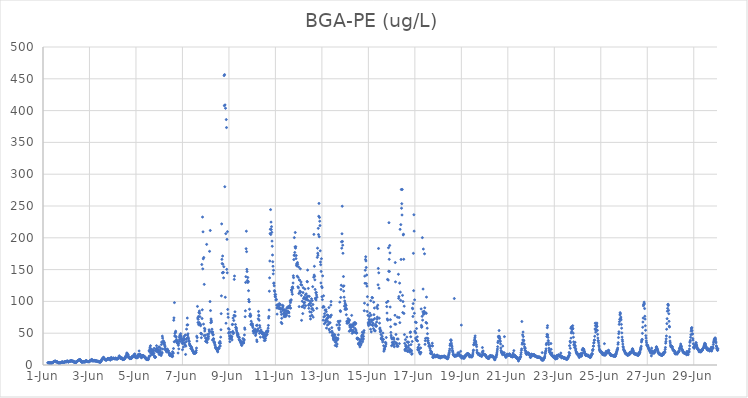
| Category | BGA-PE (ug/L) |
|---|---|
| 44348.208333333336 | 3.53 |
| 44348.21875 | 3.23 |
| 44348.229166666664 | 3.58 |
| 44348.239583333336 | 3.42 |
| 44348.25 | 3.65 |
| 44348.260416666664 | 3.82 |
| 44348.270833333336 | 3.14 |
| 44348.28125 | 3.12 |
| 44348.291666666664 | 3.01 |
| 44348.302083333336 | 2.98 |
| 44348.3125 | 3.2 |
| 44348.322916666664 | 3.79 |
| 44348.333333333336 | 2.96 |
| 44348.34375 | 3.03 |
| 44348.354166666664 | 3.2 |
| 44348.364583333336 | 3.13 |
| 44348.375 | 3.04 |
| 44348.385416666664 | 3.1 |
| 44348.395833333336 | 3.68 |
| 44348.40625 | 3.52 |
| 44348.416666666664 | 3.73 |
| 44348.427083333336 | 3.97 |
| 44348.4375 | 4.63 |
| 44348.447916666664 | 4.94 |
| 44348.458333333336 | 5.03 |
| 44348.46875 | 5.09 |
| 44348.479166666664 | 5.72 |
| 44348.489583333336 | 5.74 |
| 44348.5 | 5.69 |
| 44348.510416666664 | 5.68 |
| 44348.520833333336 | 5.97 |
| 44348.53125 | 6.37 |
| 44348.541666666664 | 5.16 |
| 44348.552083333336 | 5.57 |
| 44348.5625 | 5.05 |
| 44348.572916666664 | 4.85 |
| 44348.583333333336 | 4.99 |
| 44348.59375 | 5.27 |
| 44348.604166666664 | 5.09 |
| 44348.614583333336 | 4.27 |
| 44348.625 | 4.83 |
| 44348.635416666664 | 4.36 |
| 44348.645833333336 | 4.21 |
| 44348.65625 | 3.02 |
| 44348.666666666664 | 3.1 |
| 44348.677083333336 | 3.44 |
| 44348.6875 | 3.7 |
| 44348.697916666664 | 3.22 |
| 44348.708333333336 | 2.91 |
| 44348.71875 | 3 |
| 44348.729166666664 | 3.87 |
| 44348.739583333336 | 3.36 |
| 44348.75 | 3.62 |
| 44348.760416666664 | 3.22 |
| 44348.770833333336 | 3.89 |
| 44348.78125 | 4.23 |
| 44348.791666666664 | 4.08 |
| 44348.802083333336 | 4.46 |
| 44348.8125 | 4.6 |
| 44348.822916666664 | 3.99 |
| 44348.833333333336 | 4.69 |
| 44348.84375 | 5 |
| 44348.854166666664 | 4.03 |
| 44348.864583333336 | 4.51 |
| 44348.875 | 4.02 |
| 44348.885416666664 | 4.05 |
| 44348.895833333336 | 4.16 |
| 44348.90625 | 4.16 |
| 44348.916666666664 | 4.5 |
| 44348.927083333336 | 4.9 |
| 44348.9375 | 5.03 |
| 44348.947916666664 | 4.99 |
| 44348.958333333336 | 5.2 |
| 44348.96875 | 4.94 |
| 44348.979166666664 | 5.28 |
| 44348.989583333336 | 5.08 |
| 44349.0 | 5.03 |
| 44349.010416666664 | 5.14 |
| 44349.020833333336 | 5.26 |
| 44349.03125 | 6.22 |
| 44349.041666666664 | 6.49 |
| 44349.052083333336 | 5.85 |
| 44349.0625 | 5.36 |
| 44349.072916666664 | 5.7 |
| 44349.083333333336 | 4.73 |
| 44349.09375 | 4.7 |
| 44349.104166666664 | 5.08 |
| 44349.114583333336 | 5.92 |
| 44349.125 | 5.86 |
| 44349.135416666664 | 5.6 |
| 44349.145833333336 | 5.92 |
| 44349.15625 | 5.67 |
| 44349.166666666664 | 6.01 |
| 44349.177083333336 | 6.52 |
| 44349.1875 | 6.09 |
| 44349.197916666664 | 6.7 |
| 44349.208333333336 | 6.52 |
| 44349.21875 | 6.6 |
| 44349.229166666664 | 6.83 |
| 44349.239583333336 | 6.26 |
| 44349.25 | 6.33 |
| 44349.260416666664 | 6 |
| 44349.270833333336 | 5.93 |
| 44349.28125 | 5.61 |
| 44349.291666666664 | 5.34 |
| 44349.302083333336 | 6.12 |
| 44349.3125 | 4.7 |
| 44349.322916666664 | 4.98 |
| 44349.333333333336 | 5.22 |
| 44349.34375 | 4.91 |
| 44349.354166666664 | 4.45 |
| 44349.364583333336 | 4.09 |
| 44349.375 | 4.23 |
| 44349.385416666664 | 4.86 |
| 44349.395833333336 | 3.84 |
| 44349.40625 | 4.57 |
| 44349.416666666664 | 4.26 |
| 44349.427083333336 | 3.85 |
| 44349.4375 | 4.9 |
| 44349.447916666664 | 5.09 |
| 44349.458333333336 | 5.29 |
| 44349.46875 | 6.02 |
| 44349.479166666664 | 6.06 |
| 44349.489583333336 | 6.38 |
| 44349.5 | 6.63 |
| 44349.510416666664 | 6.68 |
| 44349.520833333336 | 7.1 |
| 44349.53125 | 7.1 |
| 44349.541666666664 | 7.68 |
| 44349.552083333336 | 8 |
| 44349.5625 | 8.58 |
| 44349.572916666664 | 8.28 |
| 44349.583333333336 | 8.42 |
| 44349.59375 | 8.44 |
| 44349.604166666664 | 8.3 |
| 44349.614583333336 | 6.85 |
| 44349.625 | 6.81 |
| 44349.635416666664 | 5.51 |
| 44349.645833333336 | 5.53 |
| 44349.65625 | 4.84 |
| 44349.666666666664 | 4.74 |
| 44349.677083333336 | 4.25 |
| 44349.6875 | 4.99 |
| 44349.697916666664 | 4.61 |
| 44349.708333333336 | 4.88 |
| 44349.71875 | 5.2 |
| 44349.729166666664 | 5.36 |
| 44349.739583333336 | 4.64 |
| 44349.75 | 4.87 |
| 44349.760416666664 | 5.46 |
| 44349.770833333336 | 5.43 |
| 44349.78125 | 5.07 |
| 44349.791666666664 | 5.59 |
| 44349.802083333336 | 4.3 |
| 44349.8125 | 5.21 |
| 44349.822916666664 | 5.59 |
| 44349.833333333336 | 5.76 |
| 44349.84375 | 6.41 |
| 44349.854166666664 | 6.95 |
| 44349.864583333336 | 6.71 |
| 44349.875 | 6.48 |
| 44349.885416666664 | 6.28 |
| 44349.895833333336 | 5.22 |
| 44349.90625 | 5.64 |
| 44349.916666666664 | 5.41 |
| 44349.927083333336 | 5.2 |
| 44349.9375 | 5.19 |
| 44349.947916666664 | 5.18 |
| 44349.958333333336 | 5.25 |
| 44349.96875 | 5.46 |
| 44349.979166666664 | 5.4 |
| 44349.989583333336 | 5.94 |
| 44350.0 | 6.13 |
| 44350.010416666664 | 5.98 |
| 44350.020833333336 | 6.73 |
| 44350.03125 | 6.53 |
| 44350.041666666664 | 6.68 |
| 44350.052083333336 | 6.89 |
| 44350.0625 | 6.54 |
| 44350.072916666664 | 7.18 |
| 44350.083333333336 | 8.68 |
| 44350.09375 | 6.75 |
| 44350.104166666664 | 8.64 |
| 44350.114583333336 | 7.33 |
| 44350.125 | 7.49 |
| 44350.135416666664 | 6.47 |
| 44350.145833333336 | 6.52 |
| 44350.15625 | 6.51 |
| 44350.166666666664 | 7.18 |
| 44350.177083333336 | 6.75 |
| 44350.1875 | 6.52 |
| 44350.197916666664 | 6.59 |
| 44350.208333333336 | 7.23 |
| 44350.21875 | 6.58 |
| 44350.229166666664 | 7.03 |
| 44350.239583333336 | 6.45 |
| 44350.25 | 6.15 |
| 44350.260416666664 | 6.91 |
| 44350.270833333336 | 6.15 |
| 44350.28125 | 6.57 |
| 44350.291666666664 | 6.07 |
| 44350.302083333336 | 6.14 |
| 44350.3125 | 6.23 |
| 44350.322916666664 | 6 |
| 44350.333333333336 | 6.11 |
| 44350.34375 | 5.78 |
| 44350.354166666664 | 5.55 |
| 44350.364583333336 | 5.4 |
| 44350.375 | 4.93 |
| 44350.385416666664 | 5.82 |
| 44350.395833333336 | 5.38 |
| 44350.40625 | 5.09 |
| 44350.416666666664 | 5.43 |
| 44350.427083333336 | 4.65 |
| 44350.4375 | 4.91 |
| 44350.447916666664 | 4.56 |
| 44350.458333333336 | 4.35 |
| 44350.46875 | 4.82 |
| 44350.479166666664 | 4.73 |
| 44350.489583333336 | 5.73 |
| 44350.5 | 5.99 |
| 44350.510416666664 | 6.62 |
| 44350.520833333336 | 7.7 |
| 44350.53125 | 8.76 |
| 44350.541666666664 | 9.12 |
| 44350.552083333336 | 9.67 |
| 44350.5625 | 10.07 |
| 44350.572916666664 | 10.57 |
| 44350.583333333336 | 11.12 |
| 44350.59375 | 11.06 |
| 44350.604166666664 | 12.14 |
| 44350.614583333336 | 11.14 |
| 44350.625 | 11.09 |
| 44350.635416666664 | 10.12 |
| 44350.645833333336 | 8.65 |
| 44350.65625 | 8.45 |
| 44350.666666666664 | 9.01 |
| 44350.677083333336 | 8.37 |
| 44350.6875 | 8.31 |
| 44350.697916666664 | 7.74 |
| 44350.708333333336 | 7.95 |
| 44350.71875 | 7.88 |
| 44350.729166666664 | 7.85 |
| 44350.739583333336 | 8.01 |
| 44350.75 | 8.26 |
| 44350.760416666664 | 8.72 |
| 44350.770833333336 | 9.41 |
| 44350.78125 | 9.94 |
| 44350.791666666664 | 10.33 |
| 44350.802083333336 | 10.52 |
| 44350.8125 | 9.42 |
| 44350.822916666664 | 9.52 |
| 44350.833333333336 | 9.24 |
| 44350.84375 | 9.43 |
| 44350.854166666664 | 9.84 |
| 44350.864583333336 | 10.28 |
| 44350.875 | 9.24 |
| 44350.885416666664 | 8.03 |
| 44350.895833333336 | 7.84 |
| 44350.90625 | 8.31 |
| 44350.916666666664 | 10.1 |
| 44350.927083333336 | 10.98 |
| 44350.9375 | 11.9 |
| 44350.947916666664 | 10.52 |
| 44350.958333333336 | 9.74 |
| 44350.96875 | 9.78 |
| 44350.979166666664 | 10.59 |
| 44350.989583333336 | 9.84 |
| 44351.0 | 9.63 |
| 44351.010416666664 | 10.08 |
| 44351.020833333336 | 10.25 |
| 44351.03125 | 10.81 |
| 44351.041666666664 | 10.83 |
| 44351.052083333336 | 10.41 |
| 44351.0625 | 10.12 |
| 44351.072916666664 | 10.06 |
| 44351.083333333336 | 9.76 |
| 44351.09375 | 10.1 |
| 44351.104166666664 | 9.9 |
| 44351.114583333336 | 9.51 |
| 44351.125 | 11.16 |
| 44351.135416666664 | 9.93 |
| 44351.145833333336 | 9.77 |
| 44351.15625 | 9.96 |
| 44351.166666666664 | 9.6 |
| 44351.177083333336 | 9.45 |
| 44351.1875 | 10.03 |
| 44351.197916666664 | 9.64 |
| 44351.208333333336 | 9.4 |
| 44351.21875 | 9.98 |
| 44351.229166666664 | 11.03 |
| 44351.239583333336 | 10.57 |
| 44351.25 | 11.9 |
| 44351.260416666664 | 11.45 |
| 44351.270833333336 | 11.64 |
| 44351.28125 | 14.46 |
| 44351.291666666664 | 11.91 |
| 44351.302083333336 | 11.73 |
| 44351.3125 | 11.4 |
| 44351.322916666664 | 12.2 |
| 44351.333333333336 | 10.23 |
| 44351.34375 | 10.81 |
| 44351.354166666664 | 11.25 |
| 44351.364583333336 | 10.19 |
| 44351.375 | 11.21 |
| 44351.385416666664 | 11.07 |
| 44351.395833333336 | 11.1 |
| 44351.40625 | 10.48 |
| 44351.416666666664 | 9.68 |
| 44351.427083333336 | 8.52 |
| 44351.4375 | 8.58 |
| 44351.447916666664 | 8.83 |
| 44351.458333333336 | 8.92 |
| 44351.46875 | 9.45 |
| 44351.479166666664 | 8.79 |
| 44351.489583333336 | 9.2 |
| 44351.5 | 9.51 |
| 44351.510416666664 | 10.08 |
| 44351.520833333336 | 10.21 |
| 44351.53125 | 12.13 |
| 44351.541666666664 | 12.22 |
| 44351.552083333336 | 13.61 |
| 44351.5625 | 13.64 |
| 44351.572916666664 | 13.13 |
| 44351.583333333336 | 12.43 |
| 44351.59375 | 15.88 |
| 44351.604166666664 | 18.5 |
| 44351.614583333336 | 18.88 |
| 44351.625 | 16.61 |
| 44351.635416666664 | 13 |
| 44351.645833333336 | 16.12 |
| 44351.65625 | 16.67 |
| 44351.666666666664 | 15 |
| 44351.677083333336 | 12.3 |
| 44351.6875 | 11.74 |
| 44351.697916666664 | 11.86 |
| 44351.708333333336 | 11.52 |
| 44351.71875 | 11.4 |
| 44351.729166666664 | 10.44 |
| 44351.739583333336 | 9.79 |
| 44351.75 | 11.57 |
| 44351.760416666664 | 10.46 |
| 44351.770833333336 | 10.32 |
| 44351.78125 | 10.03 |
| 44351.791666666664 | 10.38 |
| 44351.802083333336 | 10.24 |
| 44351.8125 | 11.02 |
| 44351.822916666664 | 12.71 |
| 44351.833333333336 | 12.86 |
| 44351.84375 | 13.06 |
| 44351.854166666664 | 14.04 |
| 44351.864583333336 | 12.83 |
| 44351.875 | 12.83 |
| 44351.885416666664 | 13.77 |
| 44351.895833333336 | 14.64 |
| 44351.90625 | 14.58 |
| 44351.916666666664 | 13.58 |
| 44351.927083333336 | 16.34 |
| 44351.9375 | 16.75 |
| 44351.947916666664 | 17.35 |
| 44351.958333333336 | 12.43 |
| 44351.96875 | 13.7 |
| 44351.979166666664 | 12.48 |
| 44351.989583333336 | 12.65 |
| 44352.0 | 11.52 |
| 44352.010416666664 | 12.32 |
| 44352.020833333336 | 11.49 |
| 44352.03125 | 11.6 |
| 44352.041666666664 | 11.51 |
| 44352.052083333336 | 13.04 |
| 44352.0625 | 14.42 |
| 44352.072916666664 | 11.45 |
| 44352.083333333336 | 14.46 |
| 44352.09375 | 16.26 |
| 44352.104166666664 | 14.12 |
| 44352.114583333336 | 16.59 |
| 44352.125 | 15.27 |
| 44352.135416666664 | 22.07 |
| 44352.145833333336 | 14.95 |
| 44352.15625 | 13.95 |
| 44352.166666666664 | 17.03 |
| 44352.177083333336 | 14.49 |
| 44352.1875 | 16.6 |
| 44352.197916666664 | 14.04 |
| 44352.208333333336 | 14.19 |
| 44352.21875 | 12.05 |
| 44352.229166666664 | 13.56 |
| 44352.239583333336 | 11.41 |
| 44352.25 | 14.67 |
| 44352.260416666664 | 12.67 |
| 44352.270833333336 | 13.41 |
| 44352.28125 | 14.89 |
| 44352.291666666664 | 14.52 |
| 44352.302083333336 | 14.53 |
| 44352.3125 | 14.86 |
| 44352.322916666664 | 14.32 |
| 44352.333333333336 | 14.44 |
| 44352.34375 | 13.39 |
| 44352.354166666664 | 13.22 |
| 44352.364583333336 | 12.22 |
| 44352.375 | 13.19 |
| 44352.385416666664 | 11.57 |
| 44352.395833333336 | 12.24 |
| 44352.40625 | 11.77 |
| 44352.416666666664 | 11.02 |
| 44352.427083333336 | 10.33 |
| 44352.4375 | 9.11 |
| 44352.447916666664 | 9.06 |
| 44352.458333333336 | 9.18 |
| 44352.46875 | 8.52 |
| 44352.479166666664 | 9.15 |
| 44352.489583333336 | 9.42 |
| 44352.5 | 8.91 |
| 44352.510416666664 | 8.53 |
| 44352.520833333336 | 8.19 |
| 44352.53125 | 8.76 |
| 44352.541666666664 | 10.24 |
| 44352.552083333336 | 12.33 |
| 44352.5625 | 22.27 |
| 44352.572916666664 | 14.05 |
| 44352.583333333336 | 21.02 |
| 44352.59375 | 24.91 |
| 44352.604166666664 | 27.84 |
| 44352.614583333336 | 14.46 |
| 44352.625 | 30.29 |
| 44352.635416666664 | 18.7 |
| 44352.645833333336 | 22.19 |
| 44352.65625 | 24.41 |
| 44352.666666666664 | 24.31 |
| 44352.677083333336 | 20.45 |
| 44352.6875 | 16.5 |
| 44352.697916666664 | 20.29 |
| 44352.708333333336 | 23.74 |
| 44352.71875 | 18.52 |
| 44352.729166666664 | 16.67 |
| 44352.739583333336 | 18.59 |
| 44352.75 | 22.34 |
| 44352.760416666664 | 22.6 |
| 44352.770833333336 | 18.29 |
| 44352.78125 | 26.2 |
| 44352.791666666664 | 14.34 |
| 44352.802083333336 | 13.15 |
| 44352.8125 | 12.08 |
| 44352.822916666664 | 12.18 |
| 44352.833333333336 | 12.1 |
| 44352.84375 | 12.44 |
| 44352.854166666664 | 22.61 |
| 44352.864583333336 | 24.68 |
| 44352.875 | 21.36 |
| 44352.885416666664 | 30.33 |
| 44352.895833333336 | 26.55 |
| 44352.90625 | 25.59 |
| 44352.916666666664 | 24.11 |
| 44352.927083333336 | 21.31 |
| 44352.9375 | 24.36 |
| 44352.947916666664 | 22.37 |
| 44352.958333333336 | 20.47 |
| 44352.96875 | 19.36 |
| 44352.979166666664 | 23.79 |
| 44352.989583333336 | 28.5 |
| 44353.0 | 16.45 |
| 44353.010416666664 | 27.93 |
| 44353.020833333336 | 20.27 |
| 44353.03125 | 21.27 |
| 44353.041666666664 | 22.49 |
| 44353.052083333336 | 16.94 |
| 44353.0625 | 19.04 |
| 44353.072916666664 | 25.84 |
| 44353.083333333336 | 14.91 |
| 44353.09375 | 32.11 |
| 44353.104166666664 | 35.99 |
| 44353.114583333336 | 17.8 |
| 44353.125 | 19.66 |
| 44353.135416666664 | 45.39 |
| 44353.145833333336 | 42.31 |
| 44353.15625 | 25.1 |
| 44353.166666666664 | 35.18 |
| 44353.177083333336 | 38.22 |
| 44353.1875 | 35.63 |
| 44353.197916666664 | 33.41 |
| 44353.208333333336 | 34.97 |
| 44353.21875 | 35.68 |
| 44353.229166666664 | 32.75 |
| 44353.239583333336 | 30.49 |
| 44353.25 | 28.86 |
| 44353.260416666664 | 26.33 |
| 44353.270833333336 | 23.9 |
| 44353.28125 | 24.6 |
| 44353.291666666664 | 22.89 |
| 44353.302083333336 | 22.86 |
| 44353.3125 | 20.66 |
| 44353.322916666664 | 21.84 |
| 44353.333333333336 | 22.81 |
| 44353.34375 | 22.75 |
| 44353.354166666664 | 25 |
| 44353.364583333336 | 23.45 |
| 44353.375 | 22.8 |
| 44353.385416666664 | 22.33 |
| 44353.395833333336 | 22.24 |
| 44353.40625 | 19.55 |
| 44353.416666666664 | 19.35 |
| 44353.427083333336 | 18.19 |
| 44353.4375 | 15.84 |
| 44353.447916666664 | 17.3 |
| 44353.458333333336 | 16.44 |
| 44353.46875 | 14.48 |
| 44353.479166666664 | 16.44 |
| 44353.489583333336 | 17.68 |
| 44353.5 | 15.49 |
| 44353.510416666664 | 15.39 |
| 44353.520833333336 | 16.07 |
| 44353.53125 | 15.64 |
| 44353.541666666664 | 14.23 |
| 44353.552083333336 | 15.72 |
| 44353.5625 | 12.98 |
| 44353.572916666664 | 20.81 |
| 44353.583333333336 | 13.93 |
| 44353.59375 | 19.13 |
| 44353.604166666664 | 18.42 |
| 44353.614583333336 | 25.86 |
| 44353.625 | 70.36 |
| 44353.635416666664 | 74.13 |
| 44353.645833333336 | 36.48 |
| 44353.65625 | 98.08 |
| 44353.666666666664 | 45.53 |
| 44353.677083333336 | 49.53 |
| 44353.6875 | 37.3 |
| 44353.697916666664 | 51.45 |
| 44353.708333333336 | 53.15 |
| 44353.71875 | 44.7 |
| 44353.729166666664 | 44.12 |
| 44353.739583333336 | 40.14 |
| 44353.75 | 38.32 |
| 44353.760416666664 | 37.32 |
| 44353.770833333336 | 35.95 |
| 44353.78125 | 34.27 |
| 44353.791666666664 | 33.94 |
| 44353.802083333336 | 34.26 |
| 44353.8125 | 18.86 |
| 44353.822916666664 | 30.8 |
| 44353.833333333336 | 33.37 |
| 44353.84375 | 25.37 |
| 44353.854166666664 | 37.55 |
| 44353.864583333336 | 43.61 |
| 44353.875 | 40.29 |
| 44353.885416666664 | 46.75 |
| 44353.895833333336 | 36.92 |
| 44353.90625 | 44.55 |
| 44353.916666666664 | 45.83 |
| 44353.927083333336 | 49.21 |
| 44353.9375 | 45.22 |
| 44353.947916666664 | 41.2 |
| 44353.958333333336 | 41.25 |
| 44353.96875 | 41.41 |
| 44353.979166666664 | 38.06 |
| 44353.989583333336 | 34.21 |
| 44354.0 | 24.06 |
| 44354.010416666664 | 33.68 |
| 44354.020833333336 | 35.54 |
| 44354.03125 | 38.84 |
| 44354.041666666664 | 28.17 |
| 44354.052083333336 | 42.51 |
| 44354.0625 | 40.7 |
| 44354.072916666664 | 45.15 |
| 44354.083333333336 | 39.75 |
| 44354.09375 | 34.94 |
| 44354.104166666664 | 32 |
| 44354.114583333336 | 31.1 |
| 44354.125 | 47.24 |
| 44354.135416666664 | 16.59 |
| 44354.145833333336 | 29.65 |
| 44354.15625 | 40.48 |
| 44354.166666666664 | 36.64 |
| 44354.177083333336 | 56.39 |
| 44354.1875 | 41.9 |
| 44354.197916666664 | 62.86 |
| 44354.208333333336 | 73.81 |
| 44354.21875 | 46.75 |
| 44354.229166666664 | 63.2 |
| 44354.239583333336 | 49.04 |
| 44354.25 | 43.65 |
| 44354.260416666664 | 41.32 |
| 44354.270833333336 | 38.62 |
| 44354.28125 | 37.64 |
| 44354.291666666664 | 36.84 |
| 44354.302083333336 | 33.61 |
| 44354.3125 | 32.26 |
| 44354.322916666664 | 30.78 |
| 44354.333333333336 | 30.43 |
| 44354.34375 | 29.45 |
| 44354.354166666664 | 29.39 |
| 44354.364583333336 | 25.86 |
| 44354.375 | 26.13 |
| 44354.385416666664 | 26.82 |
| 44354.395833333336 | 28.01 |
| 44354.40625 | 26.36 |
| 44354.416666666664 | 24.1 |
| 44354.427083333336 | 23.16 |
| 44354.4375 | 22.87 |
| 44354.447916666664 | 21.3 |
| 44354.458333333336 | 21 |
| 44354.46875 | 21.28 |
| 44354.479166666664 | 19.23 |
| 44354.489583333336 | 18.18 |
| 44354.5 | 19.58 |
| 44354.510416666664 | 19.21 |
| 44354.520833333336 | 18.24 |
| 44354.53125 | 18.39 |
| 44354.541666666664 | 18.31 |
| 44354.552083333336 | 20.36 |
| 44354.5625 | 19.76 |
| 44354.572916666664 | 19.19 |
| 44354.583333333336 | 19.87 |
| 44354.59375 | 22.81 |
| 44354.604166666664 | 26.64 |
| 44354.614583333336 | 45.29 |
| 44354.625 | 37.67 |
| 44354.635416666664 | 43.06 |
| 44354.645833333336 | 92.13 |
| 44354.65625 | 73.88 |
| 44354.666666666664 | 66.7 |
| 44354.677083333336 | 71.72 |
| 44354.6875 | 76.31 |
| 44354.697916666664 | 63.39 |
| 44354.708333333336 | 82.44 |
| 44354.71875 | 66.76 |
| 44354.729166666664 | 84.86 |
| 44354.739583333336 | 81.14 |
| 44354.75 | 76.03 |
| 44354.760416666664 | 64.14 |
| 44354.770833333336 | 63.78 |
| 44354.78125 | 61.78 |
| 44354.791666666664 | 49.85 |
| 44354.802083333336 | 49.6 |
| 44354.8125 | 42.93 |
| 44354.822916666664 | 48.6 |
| 44354.833333333336 | 157.98 |
| 44354.84375 | 73.09 |
| 44354.854166666664 | 86.81 |
| 44354.864583333336 | 232.61 |
| 44354.875 | 151.14 |
| 44354.885416666664 | 209.37 |
| 44354.895833333336 | 166.95 |
| 44354.90625 | 64.29 |
| 44354.916666666664 | 169 |
| 44354.927083333336 | 46.19 |
| 44354.9375 | 126.79 |
| 44354.947916666664 | 57.67 |
| 44354.958333333336 | 53.52 |
| 44354.96875 | 56.52 |
| 44354.979166666664 | 46.71 |
| 44354.989583333336 | 42.35 |
| 44355.0 | 37.35 |
| 44355.010416666664 | 37.46 |
| 44355.020833333336 | 37.02 |
| 44355.03125 | 40.93 |
| 44355.041666666664 | 189.64 |
| 44355.052083333336 | 38.55 |
| 44355.0625 | 35.42 |
| 44355.072916666664 | 47.95 |
| 44355.083333333336 | 43.59 |
| 44355.09375 | 42.53 |
| 44355.104166666664 | 42.79 |
| 44355.114583333336 | 41.06 |
| 44355.125 | 45.15 |
| 44355.135416666664 | 49.2 |
| 44355.145833333336 | 55.36 |
| 44355.15625 | 53.31 |
| 44355.166666666664 | 178.7 |
| 44355.177083333336 | 52.46 |
| 44355.1875 | 99.74 |
| 44355.197916666664 | 211.5 |
| 44355.208333333336 | 85.54 |
| 44355.21875 | 66.51 |
| 44355.229166666664 | 72.41 |
| 44355.239583333336 | 70.07 |
| 44355.25 | 67.53 |
| 44355.260416666664 | 52.19 |
| 44355.270833333336 | 56.31 |
| 44355.28125 | 50.02 |
| 44355.291666666664 | 39.27 |
| 44355.302083333336 | 51.98 |
| 44355.3125 | 47.32 |
| 44355.322916666664 | 47.63 |
| 44355.333333333336 | 41.39 |
| 44355.34375 | 41.08 |
| 44355.354166666664 | 35.92 |
| 44355.364583333336 | 36.9 |
| 44355.375 | 35.05 |
| 44355.385416666664 | 34.8 |
| 44355.395833333336 | 32.01 |
| 44355.40625 | 31 |
| 44355.416666666664 | 28.09 |
| 44355.427083333336 | 26.92 |
| 44355.4375 | 27.48 |
| 44355.447916666664 | 26.1 |
| 44355.458333333336 | 25.84 |
| 44355.46875 | 25 |
| 44355.479166666664 | 25.34 |
| 44355.489583333336 | 23.83 |
| 44355.5 | 22.25 |
| 44355.510416666664 | 22.89 |
| 44355.520833333336 | 20.58 |
| 44355.53125 | 25.72 |
| 44355.541666666664 | 26.17 |
| 44355.552083333336 | 27 |
| 44355.5625 | 26.02 |
| 44355.572916666664 | 25.77 |
| 44355.583333333336 | 34.92 |
| 44355.59375 | 34.05 |
| 44355.604166666664 | 29.31 |
| 44355.614583333336 | 36.97 |
| 44355.625 | 29.95 |
| 44355.635416666664 | 34.27 |
| 44355.645833333336 | 43.82 |
| 44355.65625 | 55.43 |
| 44355.666666666664 | 80.72 |
| 44355.677083333336 | 108.7 |
| 44355.6875 | 221.83 |
| 44355.697916666664 | 166.08 |
| 44355.708333333336 | 159.53 |
| 44355.71875 | 144.94 |
| 44355.729166666664 | 171.34 |
| 44355.739583333336 | 158.51 |
| 44355.75 | 145.55 |
| 44355.760416666664 | 145.49 |
| 44355.770833333336 | 137.03 |
| 44355.78125 | 154.52 |
| 44355.791666666664 | 455.06 |
| 44355.802083333336 | 407.74 |
| 44355.8125 | 456.56 |
| 44355.822916666664 | 280.3 |
| 44355.833333333336 | 408.97 |
| 44355.84375 | 106.52 |
| 44355.854166666664 | 403.65 |
| 44355.864583333336 | 206.48 |
| 44355.875 | 65.67 |
| 44355.885416666664 | 385.87 |
| 44355.895833333336 | 373.3 |
| 44355.90625 | 150.37 |
| 44355.916666666664 | 197.51 |
| 44355.927083333336 | 144.96 |
| 44355.9375 | 209.69 |
| 44355.947916666664 | 87.32 |
| 44355.958333333336 | 80.35 |
| 44355.96875 | 74.93 |
| 44355.979166666664 | 57.36 |
| 44355.989583333336 | 49.84 |
| 44356.0 | 51.26 |
| 44356.010416666664 | 56.16 |
| 44356.020833333336 | 45.55 |
| 44356.03125 | 41.15 |
| 44356.041666666664 | 36.71 |
| 44356.052083333336 | 43.04 |
| 44356.0625 | 41.89 |
| 44356.072916666664 | 46.21 |
| 44356.083333333336 | 51.37 |
| 44356.09375 | 44.85 |
| 44356.104166666664 | 44.96 |
| 44356.114583333336 | 42.46 |
| 44356.125 | 44.52 |
| 44356.135416666664 | 39.48 |
| 44356.145833333336 | 63.57 |
| 44356.15625 | 63.83 |
| 44356.166666666664 | 52.81 |
| 44356.177083333336 | 73.81 |
| 44356.1875 | 49.26 |
| 44356.197916666664 | 50.61 |
| 44356.208333333336 | 70.04 |
| 44356.21875 | 78.07 |
| 44356.229166666664 | 134.6 |
| 44356.239583333336 | 139.86 |
| 44356.25 | 76.97 |
| 44356.260416666664 | 83.65 |
| 44356.270833333336 | 77.13 |
| 44356.28125 | 63.65 |
| 44356.291666666664 | 58.85 |
| 44356.302083333336 | 59.31 |
| 44356.3125 | 55.71 |
| 44356.322916666664 | 57.86 |
| 44356.333333333336 | 53.48 |
| 44356.34375 | 51.43 |
| 44356.354166666664 | 49.05 |
| 44356.364583333336 | 46.77 |
| 44356.375 | 49.72 |
| 44356.385416666664 | 44.4 |
| 44356.395833333336 | 48.07 |
| 44356.40625 | 44.87 |
| 44356.416666666664 | 43.71 |
| 44356.427083333336 | 44.12 |
| 44356.4375 | 40.14 |
| 44356.447916666664 | 43.17 |
| 44356.458333333336 | 39.3 |
| 44356.46875 | 38.46 |
| 44356.479166666664 | 37.82 |
| 44356.489583333336 | 38.77 |
| 44356.5 | 36.49 |
| 44356.510416666664 | 34.94 |
| 44356.520833333336 | 34.83 |
| 44356.53125 | 34.4 |
| 44356.541666666664 | 31.87 |
| 44356.552083333336 | 30.69 |
| 44356.5625 | 34.85 |
| 44356.572916666664 | 34.87 |
| 44356.583333333336 | 35.77 |
| 44356.59375 | 35.86 |
| 44356.604166666664 | 41.53 |
| 44356.614583333336 | 35.5 |
| 44356.625 | 34.51 |
| 44356.635416666664 | 34.69 |
| 44356.645833333336 | 38.2 |
| 44356.65625 | 39.95 |
| 44356.666666666664 | 47.24 |
| 44356.677083333336 | 58.21 |
| 44356.6875 | 56.09 |
| 44356.697916666664 | 75.92 |
| 44356.708333333336 | 85.19 |
| 44356.71875 | 129.77 |
| 44356.729166666664 | 138.89 |
| 44356.739583333336 | 182.87 |
| 44356.75 | 210.38 |
| 44356.760416666664 | 178.23 |
| 44356.770833333336 | 150.36 |
| 44356.78125 | 146.98 |
| 44356.791666666664 | 132.79 |
| 44356.802083333336 | 129.99 |
| 44356.8125 | 137.58 |
| 44356.822916666664 | 130.18 |
| 44356.833333333336 | 131.43 |
| 44356.84375 | 116.83 |
| 44356.854166666664 | 102.98 |
| 44356.864583333336 | 99.79 |
| 44356.875 | 99.5 |
| 44356.885416666664 | 87.68 |
| 44356.895833333336 | 77.05 |
| 44356.90625 | 77.47 |
| 44356.916666666664 | 80.3 |
| 44356.927083333336 | 76.18 |
| 44356.9375 | 78.09 |
| 44356.947916666664 | 63.81 |
| 44356.958333333336 | 68.78 |
| 44356.96875 | 64.31 |
| 44356.979166666664 | 65.19 |
| 44356.989583333336 | 62.4 |
| 44357.0 | 64.3 |
| 44357.010416666664 | 64.36 |
| 44357.020833333336 | 61.33 |
| 44357.03125 | 58.76 |
| 44357.041666666664 | 53.29 |
| 44357.052083333336 | 53.62 |
| 44357.0625 | 50.12 |
| 44357.072916666664 | 53.75 |
| 44357.083333333336 | 52.61 |
| 44357.09375 | 53.64 |
| 44357.104166666664 | 54.95 |
| 44357.114583333336 | 54.99 |
| 44357.125 | 54.6 |
| 44357.135416666664 | 56.09 |
| 44357.145833333336 | 46.37 |
| 44357.15625 | 48.66 |
| 44357.166666666664 | 51.53 |
| 44357.177083333336 | 52.24 |
| 44357.1875 | 62.24 |
| 44357.197916666664 | 39.31 |
| 44357.208333333336 | 36.78 |
| 44357.21875 | 62.64 |
| 44357.229166666664 | 55.14 |
| 44357.239583333336 | 53.71 |
| 44357.25 | 56.88 |
| 44357.260416666664 | 72.64 |
| 44357.270833333336 | 84.22 |
| 44357.28125 | 78.34 |
| 44357.291666666664 | 77.1 |
| 44357.302083333336 | 70.37 |
| 44357.3125 | 49.79 |
| 44357.322916666664 | 62.05 |
| 44357.333333333336 | 59.1 |
| 44357.34375 | 53.14 |
| 44357.354166666664 | 43.79 |
| 44357.364583333336 | 53.48 |
| 44357.375 | 53.06 |
| 44357.385416666664 | 54.83 |
| 44357.395833333336 | 51.5 |
| 44357.40625 | 50.07 |
| 44357.416666666664 | 50.95 |
| 44357.427083333336 | 50.21 |
| 44357.4375 | 50.8 |
| 44357.447916666664 | 48.33 |
| 44357.458333333336 | 50.94 |
| 44357.46875 | 48.63 |
| 44357.479166666664 | 44.34 |
| 44357.489583333336 | 44.06 |
| 44357.5 | 42.79 |
| 44357.510416666664 | 45.45 |
| 44357.520833333336 | 38.36 |
| 44357.53125 | 49.64 |
| 44357.541666666664 | 47.45 |
| 44357.552083333336 | 41.39 |
| 44357.5625 | 38.82 |
| 44357.572916666664 | 41.88 |
| 44357.583333333336 | 45.2 |
| 44357.59375 | 46.89 |
| 44357.604166666664 | 51.61 |
| 44357.614583333336 | 52.78 |
| 44357.625 | 53.12 |
| 44357.635416666664 | 51.18 |
| 44357.645833333336 | 47.95 |
| 44357.65625 | 53.27 |
| 44357.666666666664 | 52.37 |
| 44357.677083333336 | 53.78 |
| 44357.6875 | 57.87 |
| 44357.697916666664 | 62.2 |
| 44357.708333333336 | 73.85 |
| 44357.71875 | 76.23 |
| 44357.729166666664 | 86.45 |
| 44357.739583333336 | 116.01 |
| 44357.75 | 137.01 |
| 44357.760416666664 | 163.48 |
| 44357.770833333336 | 206.64 |
| 44357.78125 | 213.39 |
| 44357.791666666664 | 244.31 |
| 44357.802083333336 | 205.18 |
| 44357.8125 | 224.68 |
| 44357.822916666664 | 212.94 |
| 44357.833333333336 | 217.54 |
| 44357.84375 | 208.54 |
| 44357.854166666664 | 194.78 |
| 44357.864583333336 | 186.67 |
| 44357.875 | 172.96 |
| 44357.885416666664 | 162.38 |
| 44357.895833333336 | 155.25 |
| 44357.90625 | 143.29 |
| 44357.916666666664 | 148.94 |
| 44357.927083333336 | 128.25 |
| 44357.9375 | 129.07 |
| 44357.947916666664 | 124.44 |
| 44357.958333333336 | 117.01 |
| 44357.96875 | 115.48 |
| 44357.979166666664 | 110.67 |
| 44357.989583333336 | 107.87 |
| 44358.0 | 106.96 |
| 44358.010416666664 | 110.84 |
| 44358.020833333336 | 102.07 |
| 44358.03125 | 102.43 |
| 44358.041666666664 | 103.08 |
| 44358.052083333336 | 94.03 |
| 44358.0625 | 89.67 |
| 44358.072916666664 | 79.98 |
| 44358.083333333336 | 89.86 |
| 44358.09375 | 94.53 |
| 44358.104166666664 | 93.99 |
| 44358.114583333336 | 93.41 |
| 44358.125 | 94.54 |
| 44358.135416666664 | 92.94 |
| 44358.145833333336 | 95.1 |
| 44358.15625 | 88.66 |
| 44358.166666666664 | 96.53 |
| 44358.177083333336 | 90.2 |
| 44358.1875 | 94.85 |
| 44358.197916666664 | 88.33 |
| 44358.208333333336 | 95.34 |
| 44358.21875 | 89.27 |
| 44358.229166666664 | 87.39 |
| 44358.239583333336 | 83.29 |
| 44358.25 | 67 |
| 44358.260416666664 | 79.5 |
| 44358.270833333336 | 73.43 |
| 44358.28125 | 65.12 |
| 44358.291666666664 | 88.03 |
| 44358.302083333336 | 93.91 |
| 44358.3125 | 90.92 |
| 44358.322916666664 | 85.58 |
| 44358.333333333336 | 92.85 |
| 44358.34375 | 86.9 |
| 44358.354166666664 | 81 |
| 44358.364583333336 | 81.15 |
| 44358.375 | 75.98 |
| 44358.385416666664 | 77.42 |
| 44358.395833333336 | 82.74 |
| 44358.40625 | 86.95 |
| 44358.416666666664 | 85.09 |
| 44358.427083333336 | 78.56 |
| 44358.4375 | 76.14 |
| 44358.447916666664 | 80.28 |
| 44358.458333333336 | 80.24 |
| 44358.46875 | 85.28 |
| 44358.479166666664 | 78.13 |
| 44358.489583333336 | 89.45 |
| 44358.5 | 84.8 |
| 44358.510416666664 | 81.93 |
| 44358.520833333336 | 84.75 |
| 44358.53125 | 91.3 |
| 44358.541666666664 | 83.93 |
| 44358.552083333336 | 90.24 |
| 44358.5625 | 90.06 |
| 44358.572916666664 | 83.35 |
| 44358.583333333336 | 81.96 |
| 44358.59375 | 76.6 |
| 44358.604166666664 | 92.82 |
| 44358.614583333336 | 93.3 |
| 44358.625 | 89.77 |
| 44358.635416666664 | 100.9 |
| 44358.645833333336 | 97.86 |
| 44358.65625 | 89.4 |
| 44358.666666666664 | 101.31 |
| 44358.677083333336 | 102.63 |
| 44358.6875 | 118.01 |
| 44358.697916666664 | 117.84 |
| 44358.708333333336 | 114.74 |
| 44358.71875 | 121.75 |
| 44358.729166666664 | 111.14 |
| 44358.739583333336 | 122.8 |
| 44358.75 | 120.57 |
| 44358.760416666664 | 128.93 |
| 44358.770833333336 | 140.29 |
| 44358.78125 | 137.35 |
| 44358.791666666664 | 165.71 |
| 44358.802083333336 | 172.66 |
| 44358.8125 | 200.29 |
| 44358.822916666664 | 172.07 |
| 44358.833333333336 | 176.95 |
| 44358.84375 | 185.75 |
| 44358.854166666664 | 208.33 |
| 44358.864583333336 | 183.72 |
| 44358.875 | 186.07 |
| 44358.885416666664 | 167.29 |
| 44358.895833333336 | 172.14 |
| 44358.90625 | 156.99 |
| 44358.916666666664 | 159.21 |
| 44358.927083333336 | 155.58 |
| 44358.9375 | 139.7 |
| 44358.947916666664 | 161.14 |
| 44358.958333333336 | 158.3 |
| 44358.96875 | 122.98 |
| 44358.979166666664 | 137.81 |
| 44358.989583333336 | 121.39 |
| 44359.0 | 154.12 |
| 44359.010416666664 | 112.42 |
| 44359.020833333336 | 91.84 |
| 44359.03125 | 133.63 |
| 44359.041666666664 | 133.51 |
| 44359.052083333336 | 116.22 |
| 44359.0625 | 113.85 |
| 44359.072916666664 | 151.23 |
| 44359.083333333336 | 115.14 |
| 44359.09375 | 126.56 |
| 44359.104166666664 | 130.58 |
| 44359.114583333336 | 109.41 |
| 44359.125 | 70.21 |
| 44359.135416666664 | 125.62 |
| 44359.145833333336 | 91.45 |
| 44359.15625 | 100.19 |
| 44359.166666666664 | 91.92 |
| 44359.177083333336 | 80.81 |
| 44359.1875 | 113.91 |
| 44359.197916666664 | 121.47 |
| 44359.208333333336 | 104.49 |
| 44359.21875 | 94.05 |
| 44359.229166666664 | 97.94 |
| 44359.239583333336 | 106.65 |
| 44359.25 | 89.79 |
| 44359.260416666664 | 98.38 |
| 44359.270833333336 | 119.41 |
| 44359.28125 | 103.28 |
| 44359.291666666664 | 110.26 |
| 44359.302083333336 | 93.28 |
| 44359.3125 | 105.19 |
| 44359.322916666664 | 111.86 |
| 44359.333333333336 | 102.95 |
| 44359.34375 | 106.53 |
| 44359.354166666664 | 105.74 |
| 44359.364583333336 | 131.27 |
| 44359.375 | 130.85 |
| 44359.385416666664 | 149.26 |
| 44359.395833333336 | 108.47 |
| 44359.40625 | 101.78 |
| 44359.416666666664 | 120.42 |
| 44359.427083333336 | 93.86 |
| 44359.4375 | 89.13 |
| 44359.447916666664 | 95.45 |
| 44359.458333333336 | 107.9 |
| 44359.46875 | 96.33 |
| 44359.479166666664 | 83.63 |
| 44359.489583333336 | 100.37 |
| 44359.5 | 76.77 |
| 44359.510416666664 | 72.38 |
| 44359.520833333336 | 97.24 |
| 44359.53125 | 92.79 |
| 44359.541666666664 | 82.96 |
| 44359.552083333336 | 104.12 |
| 44359.5625 | 88.1 |
| 44359.572916666664 | 78.09 |
| 44359.583333333336 | 101.11 |
| 44359.59375 | 89.04 |
| 44359.604166666664 | 123.15 |
| 44359.614583333336 | 95.09 |
| 44359.625 | 75.23 |
| 44359.635416666664 | 85.89 |
| 44359.645833333336 | 138.07 |
| 44359.65625 | 205.35 |
| 44359.666666666664 | 141.43 |
| 44359.677083333336 | 155.19 |
| 44359.6875 | 139.41 |
| 44359.697916666664 | 133.92 |
| 44359.708333333336 | 118.82 |
| 44359.71875 | 104.19 |
| 44359.729166666664 | 105.32 |
| 44359.739583333336 | 113.47 |
| 44359.75 | 102.22 |
| 44359.760416666664 | 114.08 |
| 44359.770833333336 | 110.15 |
| 44359.78125 | 89.04 |
| 44359.791666666664 | 106.63 |
| 44359.802083333336 | 169.2 |
| 44359.8125 | 183.68 |
| 44359.822916666664 | 175.76 |
| 44359.833333333336 | 172.52 |
| 44359.84375 | 214.86 |
| 44359.854166666664 | 205.06 |
| 44359.864583333336 | 233.83 |
| 44359.875 | 254.06 |
| 44359.885416666664 | 201.66 |
| 44359.895833333336 | 231.97 |
| 44359.90625 | 226.08 |
| 44359.916666666664 | 219.21 |
| 44359.927083333336 | 179.54 |
| 44359.9375 | 161.96 |
| 44359.947916666664 | 157.66 |
| 44359.958333333336 | 129.01 |
| 44359.96875 | 147.11 |
| 44359.979166666664 | 167.1 |
| 44359.989583333336 | 123.44 |
| 44360.0 | 107.36 |
| 44360.010416666664 | 121.61 |
| 44360.020833333336 | 102.74 |
| 44360.03125 | 140.09 |
| 44360.041666666664 | 90.57 |
| 44360.052083333336 | 70.44 |
| 44360.0625 | 92.12 |
| 44360.072916666664 | 108.83 |
| 44360.083333333336 | 75.58 |
| 44360.09375 | 91.24 |
| 44360.104166666664 | 64.79 |
| 44360.114583333336 | 80.67 |
| 44360.125 | 76.84 |
| 44360.135416666664 | 86.27 |
| 44360.145833333336 | 69.84 |
| 44360.15625 | 66.67 |
| 44360.166666666664 | 69.89 |
| 44360.177083333336 | 86.81 |
| 44360.1875 | 83.8 |
| 44360.197916666664 | 58.03 |
| 44360.208333333336 | 72.08 |
| 44360.21875 | 73.27 |
| 44360.229166666664 | 78.65 |
| 44360.239583333336 | 62.78 |
| 44360.25 | 68.67 |
| 44360.260416666664 | 78.12 |
| 44360.270833333336 | 74.23 |
| 44360.28125 | 76.32 |
| 44360.291666666664 | 64.33 |
| 44360.302083333336 | 90.3 |
| 44360.3125 | 55.44 |
| 44360.322916666664 | 56.35 |
| 44360.333333333336 | 66.53 |
| 44360.34375 | 51.77 |
| 44360.354166666664 | 66.33 |
| 44360.364583333336 | 75.38 |
| 44360.375 | 77.53 |
| 44360.385416666664 | 94.21 |
| 44360.395833333336 | 99.78 |
| 44360.40625 | 78.4 |
| 44360.416666666664 | 51.78 |
| 44360.427083333336 | 58.74 |
| 44360.4375 | 53.13 |
| 44360.447916666664 | 46.59 |
| 44360.458333333336 | 50.52 |
| 44360.46875 | 47.09 |
| 44360.479166666664 | 45.18 |
| 44360.489583333336 | 42.25 |
| 44360.5 | 40.13 |
| 44360.510416666664 | 42.67 |
| 44360.520833333336 | 38.9 |
| 44360.53125 | 48.11 |
| 44360.541666666664 | 39.39 |
| 44360.552083333336 | 43.87 |
| 44360.5625 | 47.27 |
| 44360.572916666664 | 30.74 |
| 44360.583333333336 | 35.71 |
| 44360.59375 | 41.54 |
| 44360.604166666664 | 36.16 |
| 44360.614583333336 | 37.68 |
| 44360.625 | 42.75 |
| 44360.635416666664 | 29.39 |
| 44360.645833333336 | 62.99 |
| 44360.65625 | 32.96 |
| 44360.666666666664 | 40.12 |
| 44360.677083333336 | 39.92 |
| 44360.6875 | 41.9 |
| 44360.697916666664 | 68.7 |
| 44360.708333333336 | 47.39 |
| 44360.71875 | 58.12 |
| 44360.729166666664 | 66.4 |
| 44360.739583333336 | 55.46 |
| 44360.75 | 58.13 |
| 44360.760416666664 | 62.95 |
| 44360.770833333336 | 98.86 |
| 44360.78125 | 69.15 |
| 44360.791666666664 | 85.43 |
| 44360.802083333336 | 84.02 |
| 44360.8125 | 106.22 |
| 44360.822916666664 | 118.81 |
| 44360.833333333336 | 125.37 |
| 44360.84375 | 193.72 |
| 44360.854166666664 | 183.69 |
| 44360.864583333336 | 206.31 |
| 44360.875 | 249.67 |
| 44360.885416666664 | 194.23 |
| 44360.895833333336 | 188.36 |
| 44360.90625 | 175.66 |
| 44360.916666666664 | 123.47 |
| 44360.927083333336 | 139.09 |
| 44360.9375 | 116.17 |
| 44360.947916666664 | 124.46 |
| 44360.958333333336 | 106.59 |
| 44360.96875 | 92.47 |
| 44360.979166666664 | 100.61 |
| 44360.989583333336 | 87.74 |
| 44361.0 | 97.18 |
| 44361.010416666664 | 95.16 |
| 44361.020833333336 | 87.39 |
| 44361.03125 | 89.64 |
| 44361.041666666664 | 93.59 |
| 44361.052083333336 | 79.05 |
| 44361.0625 | 87.88 |
| 44361.072916666664 | 68.8 |
| 44361.083333333336 | 65.48 |
| 44361.09375 | 66.51 |
| 44361.104166666664 | 68.04 |
| 44361.114583333336 | 68.54 |
| 44361.125 | 72.85 |
| 44361.135416666664 | 66.22 |
| 44361.145833333336 | 66.87 |
| 44361.15625 | 68.69 |
| 44361.166666666664 | 71.04 |
| 44361.177083333336 | 53.09 |
| 44361.1875 | 70.54 |
| 44361.197916666664 | 61.61 |
| 44361.208333333336 | 59.51 |
| 44361.21875 | 63 |
| 44361.229166666664 | 62.64 |
| 44361.239583333336 | 55.8 |
| 44361.25 | 54.02 |
| 44361.260416666664 | 55.33 |
| 44361.270833333336 | 59.72 |
| 44361.28125 | 78.02 |
| 44361.291666666664 | 63.35 |
| 44361.302083333336 | 49.8 |
| 44361.3125 | 62.19 |
| 44361.322916666664 | 61.95 |
| 44361.333333333336 | 52.78 |
| 44361.34375 | 54.86 |
| 44361.354166666664 | 59.79 |
| 44361.364583333336 | 65.71 |
| 44361.375 | 51.36 |
| 44361.385416666664 | 51.75 |
| 44361.395833333336 | 63.96 |
| 44361.40625 | 65.09 |
| 44361.416666666664 | 66.91 |
| 44361.427083333336 | 57.42 |
| 44361.4375 | 63.91 |
| 44361.447916666664 | 51.37 |
| 44361.458333333336 | 65.64 |
| 44361.46875 | 54.8 |
| 44361.479166666664 | 50.03 |
| 44361.489583333336 | 51.11 |
| 44361.5 | 50.35 |
| 44361.510416666664 | 41.39 |
| 44361.520833333336 | 42.57 |
| 44361.53125 | 41.24 |
| 44361.541666666664 | 40.35 |
| 44361.552083333336 | 41.72 |
| 44361.5625 | 41.18 |
| 44361.572916666664 | 33.39 |
| 44361.583333333336 | 33.03 |
| 44361.59375 | 35.05 |
| 44361.604166666664 | 31.99 |
| 44361.614583333336 | 40.21 |
| 44361.625 | 34.55 |
| 44361.635416666664 | 28.49 |
| 44361.645833333336 | 34.36 |
| 44361.65625 | 37.49 |
| 44361.666666666664 | 37.09 |
| 44361.677083333336 | 31.53 |
| 44361.6875 | 33.43 |
| 44361.697916666664 | 40.39 |
| 44361.708333333336 | 45.46 |
| 44361.71875 | 42.69 |
| 44361.729166666664 | 47.05 |
| 44361.739583333336 | 51.5 |
| 44361.75 | 36.49 |
| 44361.760416666664 | 47.96 |
| 44361.770833333336 | 39.89 |
| 44361.78125 | 41.41 |
| 44361.791666666664 | 44.96 |
| 44361.802083333336 | 51.02 |
| 44361.8125 | 54.09 |
| 44361.822916666664 | 85.35 |
| 44361.833333333336 | 97.2 |
| 44361.84375 | 139.74 |
| 44361.854166666664 | 128.51 |
| 44361.864583333336 | 149.04 |
| 44361.875 | 165.89 |
| 44361.885416666664 | 170.2 |
| 44361.895833333336 | 163.62 |
| 44361.90625 | 153.38 |
| 44361.916666666664 | 127.93 |
| 44361.927083333336 | 141.5 |
| 44361.9375 | 123.94 |
| 44361.947916666664 | 84.22 |
| 44361.958333333336 | 107.4 |
| 44361.96875 | 94.68 |
| 44361.979166666664 | 78.13 |
| 44361.989583333336 | 66.13 |
| 44362.0 | 64.27 |
| 44362.010416666664 | 62.01 |
| 44362.020833333336 | 71.48 |
| 44362.03125 | 68.24 |
| 44362.041666666664 | 76.17 |
| 44362.052083333336 | 66.34 |
| 44362.0625 | 81.49 |
| 44362.072916666664 | 71.16 |
| 44362.083333333336 | 63.88 |
| 44362.09375 | 56.2 |
| 44362.104166666664 | 101.09 |
| 44362.114583333336 | 78.22 |
| 44362.125 | 52.09 |
| 44362.135416666664 | 68.15 |
| 44362.145833333336 | 71.12 |
| 44362.15625 | 106.23 |
| 44362.166666666664 | 62.95 |
| 44362.177083333336 | 105.67 |
| 44362.1875 | 62.08 |
| 44362.197916666664 | 65.62 |
| 44362.208333333336 | 71.07 |
| 44362.21875 | 57.28 |
| 44362.229166666664 | 98.81 |
| 44362.239583333336 | 79.17 |
| 44362.25 | 54.69 |
| 44362.260416666664 | 89.55 |
| 44362.270833333336 | 73.04 |
| 44362.28125 | 53.66 |
| 44362.291666666664 | 53.72 |
| 44362.302083333336 | 63.86 |
| 44362.3125 | 61.64 |
| 44362.322916666664 | 62.08 |
| 44362.333333333336 | 60.87 |
| 44362.34375 | 61.37 |
| 44362.354166666664 | 67.49 |
| 44362.364583333336 | 91.4 |
| 44362.375 | 72.03 |
| 44362.385416666664 | 75.25 |
| 44362.395833333336 | 88.72 |
| 44362.40625 | 94.12 |
| 44362.416666666664 | 126.05 |
| 44362.427083333336 | 151.83 |
| 44362.4375 | 183.23 |
| 44362.447916666664 | 144.9 |
| 44362.458333333336 | 120.75 |
| 44362.46875 | 73.63 |
| 44362.479166666664 | 65.82 |
| 44362.489583333336 | 56.7 |
| 44362.5 | 58.16 |
| 44362.510416666664 | 52.11 |
| 44362.520833333336 | 52.79 |
| 44362.53125 | 54.4 |
| 44362.541666666664 | 47.92 |
| 44362.552083333336 | 41.45 |
| 44362.5625 | 42.53 |
| 44362.572916666664 | 40.36 |
| 44362.583333333336 | 40.16 |
| 44362.59375 | 45.18 |
| 44362.604166666664 | 41.27 |
| 44362.614583333336 | 36.24 |
| 44362.625 | 50.28 |
| 44362.635416666664 | 40.28 |
| 44362.645833333336 | 40.24 |
| 44362.65625 | 30.25 |
| 44362.666666666664 | 21.66 |
| 44362.677083333336 | 23.6 |
| 44362.6875 | 25.95 |
| 44362.697916666664 | 24.81 |
| 44362.708333333336 | 28.83 |
| 44362.71875 | 28.66 |
| 44362.729166666664 | 35.58 |
| 44362.739583333336 | 29.68 |
| 44362.75 | 34.89 |
| 44362.760416666664 | 32.95 |
| 44362.770833333336 | 43.24 |
| 44362.78125 | 98.28 |
| 44362.791666666664 | 91.82 |
| 44362.802083333336 | 81.68 |
| 44362.8125 | 72.36 |
| 44362.822916666664 | 134.56 |
| 44362.833333333336 | 70.44 |
| 44362.84375 | 100.16 |
| 44362.854166666664 | 133.59 |
| 44362.864583333336 | 184.4 |
| 44362.875 | 147.42 |
| 44362.885416666664 | 223.76 |
| 44362.895833333336 | 166.17 |
| 44362.90625 | 147.07 |
| 44362.916666666664 | 187.94 |
| 44362.927083333336 | 176.23 |
| 44362.9375 | 91.15 |
| 44362.947916666664 | 71.23 |
| 44362.958333333336 | 60.18 |
| 44362.96875 | 51.21 |
| 44362.979166666664 | 46.64 |
| 44362.989583333336 | 43.88 |
| 44363.0 | 30.27 |
| 44363.010416666664 | 41.11 |
| 44363.020833333336 | 41.58 |
| 44363.03125 | 35.56 |
| 44363.041666666664 | 34.98 |
| 44363.052083333336 | 31.66 |
| 44363.0625 | 40.77 |
| 44363.072916666664 | 34.46 |
| 44363.083333333336 | 42.75 |
| 44363.09375 | 40.67 |
| 44363.104166666664 | 32.16 |
| 44363.114583333336 | 28.69 |
| 44363.125 | 36.77 |
| 44363.135416666664 | 64.3 |
| 44363.145833333336 | 78.18 |
| 44363.15625 | 161.05 |
| 44363.166666666664 | 130.72 |
| 44363.177083333336 | 63.98 |
| 44363.1875 | 48.02 |
| 44363.197916666664 | 34.57 |
| 44363.208333333336 | 34.23 |
| 44363.21875 | 31.48 |
| 44363.229166666664 | 29.44 |
| 44363.239583333336 | 40.95 |
| 44363.25 | 75.23 |
| 44363.260416666664 | 29.95 |
| 44363.270833333336 | 29.36 |
| 44363.28125 | 40.79 |
| 44363.291666666664 | 142.62 |
| 44363.302083333336 | 104.79 |
| 44363.3125 | 107.59 |
| 44363.322916666664 | 74.63 |
| 44363.333333333336 | 33.63 |
| 44363.34375 | 128.71 |
| 44363.354166666664 | 66.55 |
| 44363.364583333336 | 213.28 |
| 44363.375 | 114.6 |
| 44363.385416666664 | 101.67 |
| 44363.395833333336 | 220.71 |
| 44363.40625 | 165.96 |
| 44363.416666666664 | 275.94 |
| 44363.427083333336 | 246.49 |
| 44363.4375 | 253.67 |
| 44363.447916666664 | 235.89 |
| 44363.458333333336 | 275.99 |
| 44363.46875 | 109.49 |
| 44363.479166666664 | 82.42 |
| 44363.489583333336 | 99.73 |
| 44363.5 | 204.52 |
| 44363.510416666664 | 205.58 |
| 44363.520833333336 | 166.22 |
| 44363.53125 | 81.02 |
| 44363.541666666664 | 92.49 |
| 44363.552083333336 | 47.79 |
| 44363.5625 | 34.02 |
| 44363.572916666664 | 24.54 |
| 44363.583333333336 | 22.63 |
| 44363.59375 | 39.92 |
| 44363.604166666664 | 29.44 |
| 44363.614583333336 | 31.06 |
| 44363.625 | 25.88 |
| 44363.635416666664 | 28.29 |
| 44363.645833333336 | 27.87 |
| 44363.65625 | 43.89 |
| 44363.666666666664 | 36.37 |
| 44363.677083333336 | 21.66 |
| 44363.6875 | 21.45 |
| 44363.697916666664 | 22.84 |
| 44363.708333333336 | 35.5 |
| 44363.71875 | 27.42 |
| 44363.729166666664 | 35.86 |
| 44363.739583333336 | 30.75 |
| 44363.75 | 21.86 |
| 44363.760416666664 | 22.86 |
| 44363.770833333336 | 20.75 |
| 44363.78125 | 20.63 |
| 44363.791666666664 | 24.95 |
| 44363.802083333336 | 50.88 |
| 44363.8125 | 52.09 |
| 44363.822916666664 | 44.42 |
| 44363.833333333336 | 32.01 |
| 44363.84375 | 21.66 |
| 44363.854166666664 | 22.86 |
| 44363.864583333336 | 16.89 |
| 44363.875 | 17.97 |
| 44363.885416666664 | 37.02 |
| 44363.895833333336 | 89.37 |
| 44363.90625 | 88.34 |
| 44363.916666666664 | 76.27 |
| 44363.927083333336 | 96.52 |
| 44363.9375 | 175.57 |
| 44363.947916666664 | 116.88 |
| 44363.958333333336 | 236.24 |
| 44363.96875 | 210.49 |
| 44363.979166666664 | 81.32 |
| 44363.989583333336 | 102.43 |
| 44364.0 | 53.15 |
| 44364.010416666664 | 51.63 |
| 44364.020833333336 | 67.34 |
| 44364.03125 | 42.28 |
| 44364.041666666664 | 50.23 |
| 44364.052083333336 | 39.6 |
| 44364.0625 | 66.79 |
| 44364.072916666664 | 57.27 |
| 44364.083333333336 | 39.01 |
| 44364.09375 | 38.29 |
| 44364.104166666664 | 44.25 |
| 44364.114583333336 | 37.82 |
| 44364.125 | 24.51 |
| 44364.135416666664 | 27.28 |
| 44364.145833333336 | 23.21 |
| 44364.15625 | 27.84 |
| 44364.166666666664 | 23.9 |
| 44364.177083333336 | 31.86 |
| 44364.1875 | 25.29 |
| 44364.197916666664 | 19.38 |
| 44364.208333333336 | 20.28 |
| 44364.21875 | 19.92 |
| 44364.229166666664 | 17.23 |
| 44364.239583333336 | 18.98 |
| 44364.25 | 26.86 |
| 44364.260416666664 | 19.88 |
| 44364.270833333336 | 88.2 |
| 44364.28125 | 62.33 |
| 44364.291666666664 | 59.38 |
| 44364.302083333336 | 60.2 |
| 44364.3125 | 76.5 |
| 44364.322916666664 | 200.23 |
| 44364.333333333336 | 70.53 |
| 44364.34375 | 83.46 |
| 44364.354166666664 | 119.41 |
| 44364.364583333336 | 182.28 |
| 44364.375 | 79.55 |
| 44364.385416666664 | 80.79 |
| 44364.395833333336 | 84.43 |
| 44364.40625 | 81.15 |
| 44364.416666666664 | 174.85 |
| 44364.427083333336 | 89.91 |
| 44364.4375 | 32.45 |
| 44364.447916666664 | 38.21 |
| 44364.458333333336 | 41.77 |
| 44364.46875 | 82.15 |
| 44364.479166666664 | 66.92 |
| 44364.489583333336 | 81.13 |
| 44364.5 | 106.77 |
| 44364.510416666664 | 65.71 |
| 44364.520833333336 | 42.36 |
| 44364.53125 | 57.86 |
| 44364.541666666664 | 49.22 |
| 44364.552083333336 | 37.75 |
| 44364.5625 | 41.77 |
| 44364.572916666664 | 38.03 |
| 44364.583333333336 | 35.12 |
| 44364.59375 | 33.86 |
| 44364.604166666664 | 29.37 |
| 44364.614583333336 | 30.24 |
| 44364.625 | 30.5 |
| 44364.635416666664 | 29.44 |
| 44364.645833333336 | 30.59 |
| 44364.65625 | 26.12 |
| 44364.666666666664 | 23.09 |
| 44364.677083333336 | 18.01 |
| 44364.6875 | 18.35 |
| 44364.697916666664 | 19.95 |
| 44364.708333333336 | 21.2 |
| 44364.71875 | 20.11 |
| 44364.729166666664 | 17.38 |
| 44364.739583333336 | 30.33 |
| 44364.75 | 34.27 |
| 44364.760416666664 | 29.94 |
| 44364.770833333336 | 12.05 |
| 44364.78125 | 13.61 |
| 44364.791666666664 | 11.78 |
| 44364.802083333336 | 13.15 |
| 44364.8125 | 14.31 |
| 44364.822916666664 | 15.59 |
| 44364.833333333336 | 16.1 |
| 44364.84375 | 15.13 |
| 44364.854166666664 | 13.03 |
| 44364.864583333336 | 13.29 |
| 44364.875 | 12.76 |
| 44364.885416666664 | 13.65 |
| 44364.895833333336 | 13.46 |
| 44364.90625 | 13.27 |
| 44364.916666666664 | 13.43 |
| 44364.927083333336 | 13.45 |
| 44364.9375 | 13.76 |
| 44364.947916666664 | 14.96 |
| 44364.958333333336 | 15.73 |
| 44364.96875 | 14.59 |
| 44364.979166666664 | 14.3 |
| 44364.989583333336 | 13.49 |
| 44365.0 | 12.9 |
| 44365.010416666664 | 12.01 |
| 44365.020833333336 | 12.61 |
| 44365.03125 | 14.18 |
| 44365.041666666664 | 14 |
| 44365.052083333336 | 13.06 |
| 44365.0625 | 12.25 |
| 44365.072916666664 | 11.44 |
| 44365.083333333336 | 12.29 |
| 44365.09375 | 11.29 |
| 44365.104166666664 | 11.38 |
| 44365.114583333336 | 12.74 |
| 44365.125 | 13 |
| 44365.135416666664 | 13.64 |
| 44365.145833333336 | 12.62 |
| 44365.15625 | 12.46 |
| 44365.166666666664 | 12.87 |
| 44365.177083333336 | 13.54 |
| 44365.1875 | 13.11 |
| 44365.197916666664 | 12.75 |
| 44365.208333333336 | 12.9 |
| 44365.21875 | 12.96 |
| 44365.229166666664 | 13.44 |
| 44365.239583333336 | 13.07 |
| 44365.25 | 13.81 |
| 44365.260416666664 | 12.85 |
| 44365.270833333336 | 14.19 |
| 44365.28125 | 13.52 |
| 44365.291666666664 | 12.23 |
| 44365.302083333336 | 12.54 |
| 44365.3125 | 12.86 |
| 44365.322916666664 | 13.27 |
| 44365.333333333336 | 11.52 |
| 44365.34375 | 11.28 |
| 44365.354166666664 | 11.69 |
| 44365.364583333336 | 10.44 |
| 44365.375 | 11.47 |
| 44365.385416666664 | 11.75 |
| 44365.395833333336 | 10.9 |
| 44365.40625 | 9.81 |
| 44365.416666666664 | 10.03 |
| 44365.427083333336 | 11.9 |
| 44365.4375 | 12.33 |
| 44365.447916666664 | 14.38 |
| 44365.458333333336 | 16.17 |
| 44365.46875 | 17.81 |
| 44365.479166666664 | 19.64 |
| 44365.489583333336 | 22.26 |
| 44365.5 | 25.31 |
| 44365.510416666664 | 30.74 |
| 44365.520833333336 | 33.09 |
| 44365.53125 | 33.19 |
| 44365.541666666664 | 38.67 |
| 44365.552083333336 | 39.7 |
| 44365.5625 | 38.35 |
| 44365.572916666664 | 34.36 |
| 44365.583333333336 | 31.1 |
| 44365.59375 | 29.27 |
| 44365.604166666664 | 26.45 |
| 44365.614583333336 | 23.16 |
| 44365.625 | 21.65 |
| 44365.635416666664 | 20.06 |
| 44365.645833333336 | 16.83 |
| 44365.65625 | 15.94 |
| 44365.666666666664 | 15.77 |
| 44365.677083333336 | 16.26 |
| 44365.6875 | 14.25 |
| 44365.697916666664 | 104.51 |
| 44365.708333333336 | 13.67 |
| 44365.71875 | 14.15 |
| 44365.729166666664 | 13.53 |
| 44365.739583333336 | 15.31 |
| 44365.75 | 15.06 |
| 44365.760416666664 | 15.3 |
| 44365.770833333336 | 14.18 |
| 44365.78125 | 15.13 |
| 44365.791666666664 | 14.79 |
| 44365.802083333336 | 14.27 |
| 44365.8125 | 15.26 |
| 44365.822916666664 | 15.98 |
| 44365.833333333336 | 16.43 |
| 44365.84375 | 16.37 |
| 44365.854166666664 | 18.58 |
| 44365.864583333336 | 19.4 |
| 44365.875 | 17.76 |
| 44365.885416666664 | 18.2 |
| 44365.895833333336 | 18.17 |
| 44365.90625 | 16.19 |
| 44365.916666666664 | 14.63 |
| 44365.927083333336 | 14.53 |
| 44365.9375 | 13.96 |
| 44365.947916666664 | 14.54 |
| 44365.958333333336 | 13.88 |
| 44365.96875 | 21.48 |
| 44365.979166666664 | 13.71 |
| 44365.989583333336 | 14.75 |
| 44366.0 | 62.74 |
| 44366.010416666664 | 10.77 |
| 44366.020833333336 | 13.33 |
| 44366.03125 | 12.75 |
| 44366.041666666664 | 11.71 |
| 44366.052083333336 | 11.2 |
| 44366.0625 | 12.11 |
| 44366.072916666664 | 12.34 |
| 44366.083333333336 | 12.92 |
| 44366.09375 | 11.1 |
| 44366.104166666664 | 12.36 |
| 44366.114583333336 | 10.31 |
| 44366.125 | 11.84 |
| 44366.135416666664 | 12.7 |
| 44366.145833333336 | 11.99 |
| 44366.15625 | 13.06 |
| 44366.166666666664 | 13.06 |
| 44366.177083333336 | 15.47 |
| 44366.1875 | 14.44 |
| 44366.197916666664 | 15.54 |
| 44366.208333333336 | 15.85 |
| 44366.21875 | 15.88 |
| 44366.229166666664 | 15.41 |
| 44366.239583333336 | 16.67 |
| 44366.25 | 17.84 |
| 44366.260416666664 | 18.04 |
| 44366.270833333336 | 17.7 |
| 44366.28125 | 16.3 |
| 44366.291666666664 | 17.42 |
| 44366.302083333336 | 17.32 |
| 44366.3125 | 16.74 |
| 44366.322916666664 | 17.18 |
| 44366.333333333336 | 16.56 |
| 44366.34375 | 13.42 |
| 44366.354166666664 | 14.12 |
| 44366.364583333336 | 12.81 |
| 44366.375 | 12.8 |
| 44366.385416666664 | 14.77 |
| 44366.395833333336 | 14.09 |
| 44366.40625 | 13.08 |
| 44366.416666666664 | 13.62 |
| 44366.427083333336 | 13.32 |
| 44366.4375 | 13.34 |
| 44366.447916666664 | 12.69 |
| 44366.458333333336 | 12.64 |
| 44366.46875 | 13.61 |
| 44366.479166666664 | 14.89 |
| 44366.489583333336 | 16.87 |
| 44366.5 | 18.9 |
| 44366.510416666664 | 22.13 |
| 44366.520833333336 | 23.48 |
| 44366.53125 | 31.65 |
| 44366.541666666664 | 32.09 |
| 44366.552083333336 | 34.74 |
| 44366.5625 | 38.44 |
| 44366.572916666664 | 40.65 |
| 44366.583333333336 | 43.13 |
| 44366.59375 | 45.74 |
| 44366.604166666664 | 36.75 |
| 44366.614583333336 | 37.46 |
| 44366.625 | 35.99 |
| 44366.635416666664 | 32.62 |
| 44366.645833333336 | 31.57 |
| 44366.65625 | 28.84 |
| 44366.666666666664 | 23.32 |
| 44366.677083333336 | 20.27 |
| 44366.6875 | 19.17 |
| 44366.697916666664 | 18.63 |
| 44366.708333333336 | 18.45 |
| 44366.71875 | 18.1 |
| 44366.729166666664 | 16.6 |
| 44366.739583333336 | 16.6 |
| 44366.75 | 16.85 |
| 44366.760416666664 | 15.86 |
| 44366.770833333336 | 17.58 |
| 44366.78125 | 16.29 |
| 44366.791666666664 | 16.21 |
| 44366.802083333336 | 15.03 |
| 44366.8125 | 14.83 |
| 44366.822916666664 | 15 |
| 44366.833333333336 | 14.68 |
| 44366.84375 | 15.48 |
| 44366.854166666664 | 14.36 |
| 44366.864583333336 | 14.66 |
| 44366.875 | 13.37 |
| 44366.885416666664 | 15.02 |
| 44366.895833333336 | 19.47 |
| 44366.90625 | 27.46 |
| 44366.916666666664 | 21.29 |
| 44366.927083333336 | 16.72 |
| 44366.9375 | 22.09 |
| 44366.947916666664 | 16.83 |
| 44366.958333333336 | 17.73 |
| 44366.96875 | 17.11 |
| 44366.979166666664 | 16.07 |
| 44366.989583333336 | 16.45 |
| 44367.0 | 16.02 |
| 44367.010416666664 | 15.53 |
| 44367.020833333336 | 16.11 |
| 44367.03125 | 15.83 |
| 44367.041666666664 | 15.79 |
| 44367.052083333336 | 15 |
| 44367.0625 | 14.02 |
| 44367.072916666664 | 13.56 |
| 44367.083333333336 | 11.97 |
| 44367.09375 | 12.48 |
| 44367.104166666664 | 11.39 |
| 44367.114583333336 | 11.5 |
| 44367.125 | 11.63 |
| 44367.135416666664 | 11.13 |
| 44367.145833333336 | 11.04 |
| 44367.15625 | 10.46 |
| 44367.166666666664 | 10.28 |
| 44367.177083333336 | 10.2 |
| 44367.1875 | 10.86 |
| 44367.197916666664 | 11.62 |
| 44367.208333333336 | 13.58 |
| 44367.21875 | 13.87 |
| 44367.229166666664 | 14.16 |
| 44367.239583333336 | 13.96 |
| 44367.25 | 14.68 |
| 44367.260416666664 | 14.76 |
| 44367.270833333336 | 13.23 |
| 44367.28125 | 14.34 |
| 44367.291666666664 | 13.62 |
| 44367.302083333336 | 13.17 |
| 44367.3125 | 13.99 |
| 44367.322916666664 | 13.7 |
| 44367.333333333336 | 14.14 |
| 44367.34375 | 13.81 |
| 44367.354166666664 | 13.6 |
| 44367.364583333336 | 13.72 |
| 44367.375 | 13.43 |
| 44367.385416666664 | 11.62 |
| 44367.395833333336 | 11.58 |
| 44367.40625 | 10.79 |
| 44367.416666666664 | 11.32 |
| 44367.427083333336 | 8.44 |
| 44367.4375 | 10.87 |
| 44367.447916666664 | 8.21 |
| 44367.458333333336 | 11.22 |
| 44367.46875 | 11.99 |
| 44367.479166666664 | 12.18 |
| 44367.489583333336 | 12.92 |
| 44367.5 | 12.48 |
| 44367.510416666664 | 15.06 |
| 44367.520833333336 | 16.76 |
| 44367.53125 | 19.02 |
| 44367.541666666664 | 21.99 |
| 44367.552083333336 | 25.08 |
| 44367.5625 | 28.8 |
| 44367.572916666664 | 35.12 |
| 44367.583333333336 | 37.51 |
| 44367.59375 | 44.91 |
| 44367.604166666664 | 43.11 |
| 44367.614583333336 | 45.1 |
| 44367.625 | 54.17 |
| 44367.635416666664 | 45.04 |
| 44367.645833333336 | 41.64 |
| 44367.65625 | 42.04 |
| 44367.666666666664 | 38.54 |
| 44367.677083333336 | 36.89 |
| 44367.6875 | 33.1 |
| 44367.697916666664 | 26.71 |
| 44367.708333333336 | 22.77 |
| 44367.71875 | 20.43 |
| 44367.729166666664 | 21.21 |
| 44367.739583333336 | 19.24 |
| 44367.75 | 18.18 |
| 44367.760416666664 | 19.3 |
| 44367.770833333336 | 16.24 |
| 44367.78125 | 29.72 |
| 44367.791666666664 | 19.48 |
| 44367.802083333336 | 17.94 |
| 44367.8125 | 17.93 |
| 44367.822916666664 | 16.43 |
| 44367.833333333336 | 18.9 |
| 44367.84375 | 19.2 |
| 44367.854166666664 | 44.59 |
| 44367.864583333336 | 15.97 |
| 44367.875 | 15.59 |
| 44367.885416666664 | 14.97 |
| 44367.895833333336 | 14.64 |
| 44367.90625 | 12.99 |
| 44367.916666666664 | 11.9 |
| 44367.927083333336 | 13.77 |
| 44367.9375 | 14.37 |
| 44367.947916666664 | 14.76 |
| 44367.958333333336 | 16.9 |
| 44367.96875 | 16.4 |
| 44367.979166666664 | 14.34 |
| 44367.989583333336 | 15.85 |
| 44368.0 | 17.01 |
| 44368.010416666664 | 16.72 |
| 44368.020833333336 | 15.67 |
| 44368.03125 | 15.21 |
| 44368.041666666664 | 15.38 |
| 44368.052083333336 | 16.7 |
| 44368.0625 | 16.25 |
| 44368.072916666664 | 17.55 |
| 44368.083333333336 | 16.9 |
| 44368.09375 | 16.07 |
| 44368.104166666664 | 15.26 |
| 44368.114583333336 | 14.52 |
| 44368.125 | 14.26 |
| 44368.135416666664 | 13.66 |
| 44368.145833333336 | 13.51 |
| 44368.15625 | 13.95 |
| 44368.166666666664 | 13.58 |
| 44368.177083333336 | 13.15 |
| 44368.1875 | 12.6 |
| 44368.197916666664 | 13.45 |
| 44368.208333333336 | 12.77 |
| 44368.21875 | 16.63 |
| 44368.229166666664 | 18.66 |
| 44368.239583333336 | 13.68 |
| 44368.25 | 13.55 |
| 44368.260416666664 | 22.65 |
| 44368.270833333336 | 15.07 |
| 44368.28125 | 13.54 |
| 44368.291666666664 | 15.43 |
| 44368.302083333336 | 14.32 |
| 44368.3125 | 13.14 |
| 44368.322916666664 | 14.39 |
| 44368.333333333336 | 14.02 |
| 44368.34375 | 12.85 |
| 44368.354166666664 | 11.34 |
| 44368.364583333336 | 11.25 |
| 44368.375 | 11.21 |
| 44368.385416666664 | 11.02 |
| 44368.395833333336 | 10.8 |
| 44368.40625 | 11.29 |
| 44368.416666666664 | 11.78 |
| 44368.427083333336 | 9.82 |
| 44368.4375 | 8.62 |
| 44368.447916666664 | 8.42 |
| 44368.458333333336 | 6.2 |
| 44368.46875 | 8.46 |
| 44368.479166666664 | 9.27 |
| 44368.489583333336 | 9.31 |
| 44368.5 | 9.18 |
| 44368.510416666664 | 9.91 |
| 44368.520833333336 | 11.21 |
| 44368.53125 | 11.99 |
| 44368.541666666664 | 13.27 |
| 44368.552083333336 | 13.15 |
| 44368.5625 | 16.62 |
| 44368.572916666664 | 19.47 |
| 44368.583333333336 | 22.9 |
| 44368.59375 | 25.31 |
| 44368.604166666664 | 68.38 |
| 44368.614583333336 | 32.68 |
| 44368.625 | 34.89 |
| 44368.635416666664 | 47.34 |
| 44368.645833333336 | 39.38 |
| 44368.65625 | 51.83 |
| 44368.666666666664 | 44.74 |
| 44368.677083333336 | 39.09 |
| 44368.6875 | 38.2 |
| 44368.697916666664 | 33.34 |
| 44368.708333333336 | 32.28 |
| 44368.71875 | 28.44 |
| 44368.729166666664 | 25.97 |
| 44368.739583333336 | 23.16 |
| 44368.75 | 26.59 |
| 44368.760416666664 | 22.42 |
| 44368.770833333336 | 18.53 |
| 44368.78125 | 19.84 |
| 44368.791666666664 | 20.52 |
| 44368.802083333336 | 16.64 |
| 44368.8125 | 16.98 |
| 44368.822916666664 | 18.62 |
| 44368.833333333336 | 17.89 |
| 44368.84375 | 18.5 |
| 44368.854166666664 | 17.65 |
| 44368.864583333336 | 18.83 |
| 44368.875 | 18.06 |
| 44368.885416666664 | 19.16 |
| 44368.895833333336 | 16.47 |
| 44368.90625 | 17.82 |
| 44368.916666666664 | 16.33 |
| 44368.927083333336 | 17.25 |
| 44368.9375 | 16.28 |
| 44368.947916666664 | 15.26 |
| 44368.958333333336 | 14.16 |
| 44368.96875 | 11.96 |
| 44368.979166666664 | 11.95 |
| 44368.989583333336 | 12.49 |
| 44369.0 | 13.75 |
| 44369.010416666664 | 17.13 |
| 44369.020833333336 | 15.38 |
| 44369.03125 | 16.87 |
| 44369.041666666664 | 14.8 |
| 44369.052083333336 | 15.72 |
| 44369.0625 | 15.17 |
| 44369.072916666664 | 14.71 |
| 44369.083333333336 | 15.63 |
| 44369.09375 | 14.67 |
| 44369.104166666664 | 15.66 |
| 44369.114583333336 | 16.2 |
| 44369.125 | 16.46 |
| 44369.135416666664 | 15.6 |
| 44369.145833333336 | 15.4 |
| 44369.15625 | 14.59 |
| 44369.166666666664 | 14.52 |
| 44369.177083333336 | 13.56 |
| 44369.1875 | 13.3 |
| 44369.197916666664 | 14.66 |
| 44369.208333333336 | 13.89 |
| 44369.21875 | 13.59 |
| 44369.229166666664 | 13.42 |
| 44369.239583333336 | 12.64 |
| 44369.25 | 13.06 |
| 44369.260416666664 | 12.43 |
| 44369.270833333336 | 12.21 |
| 44369.28125 | 11.85 |
| 44369.291666666664 | 12.51 |
| 44369.302083333336 | 11.92 |
| 44369.3125 | 12.98 |
| 44369.322916666664 | 11.85 |
| 44369.333333333336 | 12.31 |
| 44369.34375 | 12.41 |
| 44369.354166666664 | 11.89 |
| 44369.364583333336 | 12.37 |
| 44369.375 | 12.42 |
| 44369.385416666664 | 12.11 |
| 44369.395833333336 | 11.96 |
| 44369.40625 | 11.4 |
| 44369.416666666664 | 10.98 |
| 44369.427083333336 | 10.26 |
| 44369.4375 | 9.17 |
| 44369.447916666664 | 9.27 |
| 44369.458333333336 | 7.83 |
| 44369.46875 | 9.15 |
| 44369.479166666664 | 19.46 |
| 44369.489583333336 | 7.48 |
| 44369.5 | 10.02 |
| 44369.510416666664 | 8.1 |
| 44369.520833333336 | 7.53 |
| 44369.53125 | 8.73 |
| 44369.541666666664 | 9.74 |
| 44369.552083333336 | 10.13 |
| 44369.5625 | 10.12 |
| 44369.572916666664 | 11.36 |
| 44369.583333333336 | 12.63 |
| 44369.59375 | 14.14 |
| 44369.604166666664 | 17.54 |
| 44369.614583333336 | 18.69 |
| 44369.625 | 20.92 |
| 44369.635416666664 | 22.59 |
| 44369.645833333336 | 25.44 |
| 44369.65625 | 31.93 |
| 44369.666666666664 | 34.07 |
| 44369.677083333336 | 44.79 |
| 44369.6875 | 48.1 |
| 44369.697916666664 | 58.61 |
| 44369.708333333336 | 61.88 |
| 44369.71875 | 47.3 |
| 44369.729166666664 | 43.44 |
| 44369.739583333336 | 38.53 |
| 44369.75 | 35.78 |
| 44369.760416666664 | 32.2 |
| 44369.770833333336 | 26.49 |
| 44369.78125 | 23.49 |
| 44369.791666666664 | 21.84 |
| 44369.802083333336 | 19.73 |
| 44369.8125 | 19.81 |
| 44369.822916666664 | 20.29 |
| 44369.833333333336 | 17.63 |
| 44369.84375 | 17.84 |
| 44369.854166666664 | 33.76 |
| 44369.864583333336 | 24.67 |
| 44369.875 | 16.71 |
| 44369.885416666664 | 15.01 |
| 44369.895833333336 | 18.84 |
| 44369.90625 | 14.45 |
| 44369.916666666664 | 15.15 |
| 44369.927083333336 | 14.85 |
| 44369.9375 | 13.75 |
| 44369.947916666664 | 12.83 |
| 44369.958333333336 | 12.48 |
| 44369.96875 | 12.64 |
| 44369.979166666664 | 12.02 |
| 44369.989583333336 | 12.39 |
| 44370.0 | 12.61 |
| 44370.010416666664 | 14.2 |
| 44370.020833333336 | 12.06 |
| 44370.03125 | 10.48 |
| 44370.041666666664 | 10.26 |
| 44370.052083333336 | 9.92 |
| 44370.0625 | 9.53 |
| 44370.072916666664 | 10.19 |
| 44370.083333333336 | 13.59 |
| 44370.09375 | 11 |
| 44370.104166666664 | 13.01 |
| 44370.114583333336 | 15.19 |
| 44370.125 | 10.24 |
| 44370.135416666664 | 13.83 |
| 44370.145833333336 | 15.23 |
| 44370.15625 | 13.53 |
| 44370.166666666664 | 15.28 |
| 44370.177083333336 | 15.2 |
| 44370.1875 | 15.95 |
| 44370.197916666664 | 15.38 |
| 44370.208333333336 | 15.57 |
| 44370.21875 | 14.38 |
| 44370.229166666664 | 13.86 |
| 44370.239583333336 | 15.26 |
| 44370.25 | 13.68 |
| 44370.260416666664 | 15.2 |
| 44370.270833333336 | 13.48 |
| 44370.28125 | 18.81 |
| 44370.291666666664 | 14.22 |
| 44370.302083333336 | 12.23 |
| 44370.3125 | 11.17 |
| 44370.322916666664 | 12.31 |
| 44370.333333333336 | 12.38 |
| 44370.34375 | 13.14 |
| 44370.354166666664 | 12.3 |
| 44370.364583333336 | 12.29 |
| 44370.375 | 11.3 |
| 44370.385416666664 | 11.51 |
| 44370.395833333336 | 11.91 |
| 44370.40625 | 11.5 |
| 44370.416666666664 | 10.29 |
| 44370.427083333336 | 10.38 |
| 44370.4375 | 10.92 |
| 44370.447916666664 | 11.33 |
| 44370.458333333336 | 11.33 |
| 44370.46875 | 9.8 |
| 44370.479166666664 | 9.72 |
| 44370.489583333336 | 10.12 |
| 44370.5 | 10.24 |
| 44370.510416666664 | 10.32 |
| 44370.520833333336 | 9.59 |
| 44370.53125 | 10.45 |
| 44370.541666666664 | 8.42 |
| 44370.552083333336 | 10.64 |
| 44370.5625 | 10.78 |
| 44370.572916666664 | 11.33 |
| 44370.583333333336 | 10.06 |
| 44370.59375 | 12.28 |
| 44370.604166666664 | 12.61 |
| 44370.614583333336 | 13.41 |
| 44370.625 | 15.09 |
| 44370.635416666664 | 19.66 |
| 44370.645833333336 | 15.03 |
| 44370.65625 | 30.37 |
| 44370.666666666664 | 18.16 |
| 44370.677083333336 | 37.34 |
| 44370.6875 | 26.2 |
| 44370.697916666664 | 35.19 |
| 44370.708333333336 | 57.88 |
| 44370.71875 | 42.26 |
| 44370.729166666664 | 50.42 |
| 44370.739583333336 | 60.15 |
| 44370.75 | 52.95 |
| 44370.760416666664 | 58.94 |
| 44370.770833333336 | 56.67 |
| 44370.78125 | 56.54 |
| 44370.791666666664 | 61.79 |
| 44370.802083333336 | 57.28 |
| 44370.8125 | 50.03 |
| 44370.822916666664 | 43.73 |
| 44370.833333333336 | 36.39 |
| 44370.84375 | 32.09 |
| 44370.854166666664 | 30.98 |
| 44370.864583333336 | 32.54 |
| 44370.875 | 27.34 |
| 44370.885416666664 | 28.13 |
| 44370.895833333336 | 35.73 |
| 44370.90625 | 29.98 |
| 44370.916666666664 | 23.47 |
| 44370.927083333336 | 25.19 |
| 44370.9375 | 20.48 |
| 44370.947916666664 | 20.91 |
| 44370.958333333336 | 19.25 |
| 44370.96875 | 17.79 |
| 44370.979166666664 | 17.23 |
| 44370.989583333336 | 18.43 |
| 44371.0 | 17.77 |
| 44371.010416666664 | 16.19 |
| 44371.020833333336 | 16.84 |
| 44371.03125 | 15.24 |
| 44371.041666666664 | 15.82 |
| 44371.052083333336 | 14.33 |
| 44371.0625 | 13.46 |
| 44371.072916666664 | 11.73 |
| 44371.083333333336 | 12.95 |
| 44371.09375 | 13.88 |
| 44371.104166666664 | 14.4 |
| 44371.114583333336 | 16.99 |
| 44371.125 | 17.72 |
| 44371.135416666664 | 15.01 |
| 44371.145833333336 | 15.34 |
| 44371.15625 | 14.86 |
| 44371.166666666664 | 13.68 |
| 44371.177083333336 | 15.05 |
| 44371.1875 | 18.53 |
| 44371.197916666664 | 23.66 |
| 44371.208333333336 | 17.89 |
| 44371.21875 | 24.19 |
| 44371.229166666664 | 26.1 |
| 44371.239583333336 | 23.57 |
| 44371.25 | 23.81 |
| 44371.260416666664 | 24.98 |
| 44371.270833333336 | 24.7 |
| 44371.28125 | 20.97 |
| 44371.291666666664 | 21.91 |
| 44371.302083333336 | 19.99 |
| 44371.3125 | 17.66 |
| 44371.322916666664 | 17.95 |
| 44371.333333333336 | 17.49 |
| 44371.34375 | 15.48 |
| 44371.354166666664 | 14.95 |
| 44371.364583333336 | 15.95 |
| 44371.375 | 16.09 |
| 44371.385416666664 | 16.38 |
| 44371.395833333336 | 15.14 |
| 44371.40625 | 15.49 |
| 44371.416666666664 | 14.4 |
| 44371.427083333336 | 14.5 |
| 44371.4375 | 14.88 |
| 44371.447916666664 | 15.79 |
| 44371.458333333336 | 14.53 |
| 44371.46875 | 14.3 |
| 44371.479166666664 | 13.99 |
| 44371.489583333336 | 14.4 |
| 44371.5 | 13.32 |
| 44371.510416666664 | 13.49 |
| 44371.520833333336 | 13.32 |
| 44371.53125 | 12.91 |
| 44371.541666666664 | 11.58 |
| 44371.552083333336 | 12.34 |
| 44371.5625 | 12.98 |
| 44371.572916666664 | 12.65 |
| 44371.583333333336 | 14.12 |
| 44371.59375 | 15.12 |
| 44371.604166666664 | 16.3 |
| 44371.614583333336 | 17.94 |
| 44371.625 | 17.05 |
| 44371.635416666664 | 17.49 |
| 44371.645833333336 | 22.45 |
| 44371.65625 | 24.21 |
| 44371.666666666664 | 24.26 |
| 44371.677083333336 | 29.58 |
| 44371.6875 | 29.73 |
| 44371.697916666664 | 34.48 |
| 44371.708333333336 | 35.14 |
| 44371.71875 | 38.97 |
| 44371.729166666664 | 39.2 |
| 44371.739583333336 | 45.14 |
| 44371.75 | 56.59 |
| 44371.760416666664 | 65.79 |
| 44371.770833333336 | 61.89 |
| 44371.78125 | 51.69 |
| 44371.791666666664 | 54.71 |
| 44371.802083333336 | 55.89 |
| 44371.8125 | 59.94 |
| 44371.822916666664 | 63.05 |
| 44371.833333333336 | 65.93 |
| 44371.84375 | 60.77 |
| 44371.854166666664 | 54.41 |
| 44371.864583333336 | 48.14 |
| 44371.875 | 42.42 |
| 44371.885416666664 | 38.25 |
| 44371.895833333336 | 37.98 |
| 44371.90625 | 34.73 |
| 44371.916666666664 | 30.92 |
| 44371.927083333336 | 28.48 |
| 44371.9375 | 25 |
| 44371.947916666664 | 23.43 |
| 44371.958333333336 | 23.68 |
| 44371.96875 | 21.76 |
| 44371.979166666664 | 21.5 |
| 44371.989583333336 | 21.42 |
| 44372.0 | 19.99 |
| 44372.010416666664 | 20.67 |
| 44372.020833333336 | 20.19 |
| 44372.03125 | 20.7 |
| 44372.041666666664 | 19.05 |
| 44372.052083333336 | 19.3 |
| 44372.0625 | 18.24 |
| 44372.072916666664 | 16.44 |
| 44372.083333333336 | 16.79 |
| 44372.09375 | 16.76 |
| 44372.104166666664 | 16.58 |
| 44372.114583333336 | 16.45 |
| 44372.125 | 15.75 |
| 44372.135416666664 | 18.67 |
| 44372.145833333336 | 16.73 |
| 44372.15625 | 33.55 |
| 44372.166666666664 | 15.46 |
| 44372.177083333336 | 15.98 |
| 44372.1875 | 16.88 |
| 44372.197916666664 | 15.48 |
| 44372.208333333336 | 17.14 |
| 44372.21875 | 19.21 |
| 44372.229166666664 | 21.64 |
| 44372.239583333336 | 19.47 |
| 44372.25 | 18.54 |
| 44372.260416666664 | 20.29 |
| 44372.270833333336 | 20.37 |
| 44372.28125 | 18.99 |
| 44372.291666666664 | 20.6 |
| 44372.302083333336 | 21.3 |
| 44372.3125 | 22.24 |
| 44372.322916666664 | 22.11 |
| 44372.333333333336 | 23.28 |
| 44372.34375 | 22.46 |
| 44372.354166666664 | 18.87 |
| 44372.364583333336 | 18.84 |
| 44372.375 | 18.57 |
| 44372.385416666664 | 18.1 |
| 44372.395833333336 | 17.26 |
| 44372.40625 | 17.29 |
| 44372.416666666664 | 15.58 |
| 44372.427083333336 | 15.36 |
| 44372.4375 | 15.08 |
| 44372.447916666664 | 15.67 |
| 44372.458333333336 | 15.44 |
| 44372.46875 | 15.46 |
| 44372.479166666664 | 14.69 |
| 44372.489583333336 | 14.84 |
| 44372.5 | 14.6 |
| 44372.510416666664 | 15.13 |
| 44372.520833333336 | 14.65 |
| 44372.53125 | 14.87 |
| 44372.541666666664 | 14.24 |
| 44372.552083333336 | 14.16 |
| 44372.5625 | 13.87 |
| 44372.572916666664 | 13.88 |
| 44372.583333333336 | 14.79 |
| 44372.59375 | 14.9 |
| 44372.604166666664 | 14.1 |
| 44372.614583333336 | 13.46 |
| 44372.625 | 13.65 |
| 44372.635416666664 | 14.81 |
| 44372.645833333336 | 17.99 |
| 44372.65625 | 17.91 |
| 44372.666666666664 | 17.11 |
| 44372.677083333336 | 20.2 |
| 44372.6875 | 21.19 |
| 44372.697916666664 | 23.1 |
| 44372.708333333336 | 24.45 |
| 44372.71875 | 24.34 |
| 44372.729166666664 | 26.76 |
| 44372.739583333336 | 32.58 |
| 44372.75 | 35.13 |
| 44372.760416666664 | 43.12 |
| 44372.770833333336 | 49.24 |
| 44372.78125 | 52.23 |
| 44372.791666666664 | 63.86 |
| 44372.802083333336 | 68.06 |
| 44372.8125 | 71.76 |
| 44372.822916666664 | 78.84 |
| 44372.833333333336 | 82.34 |
| 44372.84375 | 80.67 |
| 44372.854166666664 | 73.53 |
| 44372.864583333336 | 75.3 |
| 44372.875 | 71.01 |
| 44372.885416666664 | 63.9 |
| 44372.895833333336 | 57.85 |
| 44372.90625 | 50.51 |
| 44372.916666666664 | 43.92 |
| 44372.927083333336 | 39.82 |
| 44372.9375 | 37.07 |
| 44372.947916666664 | 32.94 |
| 44372.958333333336 | 28.92 |
| 44372.96875 | 27.99 |
| 44372.979166666664 | 24.9 |
| 44372.989583333336 | 23.64 |
| 44373.0 | 23.39 |
| 44373.010416666664 | 22.04 |
| 44373.020833333336 | 22.28 |
| 44373.03125 | 21.27 |
| 44373.041666666664 | 19.1 |
| 44373.052083333336 | 19.48 |
| 44373.0625 | 17.7 |
| 44373.072916666664 | 18.93 |
| 44373.083333333336 | 17.76 |
| 44373.09375 | 17.5 |
| 44373.104166666664 | 16.97 |
| 44373.114583333336 | 16.32 |
| 44373.125 | 17.64 |
| 44373.135416666664 | 16.51 |
| 44373.145833333336 | 15.41 |
| 44373.15625 | 15.51 |
| 44373.166666666664 | 15.16 |
| 44373.177083333336 | 15.94 |
| 44373.1875 | 16.67 |
| 44373.197916666664 | 17.08 |
| 44373.208333333336 | 16.18 |
| 44373.21875 | 16.13 |
| 44373.229166666664 | 16.43 |
| 44373.239583333336 | 17.63 |
| 44373.25 | 19.73 |
| 44373.260416666664 | 19.61 |
| 44373.270833333336 | 19.74 |
| 44373.28125 | 18.65 |
| 44373.291666666664 | 18.57 |
| 44373.302083333336 | 19.27 |
| 44373.3125 | 20.48 |
| 44373.322916666664 | 20.34 |
| 44373.333333333336 | 21.52 |
| 44373.34375 | 22.84 |
| 44373.354166666664 | 24.51 |
| 44373.364583333336 | 25.68 |
| 44373.375 | 24.67 |
| 44373.385416666664 | 21.75 |
| 44373.395833333336 | 22.64 |
| 44373.40625 | 20.49 |
| 44373.416666666664 | 18.56 |
| 44373.427083333336 | 18.17 |
| 44373.4375 | 17.36 |
| 44373.447916666664 | 17.69 |
| 44373.458333333336 | 18.31 |
| 44373.46875 | 17.49 |
| 44373.479166666664 | 17.38 |
| 44373.489583333336 | 16.69 |
| 44373.5 | 16.93 |
| 44373.510416666664 | 17.32 |
| 44373.520833333336 | 17.58 |
| 44373.53125 | 16.89 |
| 44373.541666666664 | 16.38 |
| 44373.552083333336 | 16.04 |
| 44373.5625 | 15.84 |
| 44373.572916666664 | 16.31 |
| 44373.583333333336 | 16.4 |
| 44373.59375 | 15.81 |
| 44373.604166666664 | 14.99 |
| 44373.614583333336 | 15.16 |
| 44373.625 | 17.35 |
| 44373.635416666664 | 19.31 |
| 44373.645833333336 | 17.68 |
| 44373.65625 | 17.14 |
| 44373.666666666664 | 18.34 |
| 44373.677083333336 | 20.63 |
| 44373.6875 | 20.23 |
| 44373.697916666664 | 23.43 |
| 44373.708333333336 | 24.93 |
| 44373.71875 | 27.18 |
| 44373.729166666664 | 25.28 |
| 44373.739583333336 | 29.47 |
| 44373.75 | 36.17 |
| 44373.760416666664 | 38.12 |
| 44373.770833333336 | 39.73 |
| 44373.78125 | 40.21 |
| 44373.791666666664 | 49.73 |
| 44373.802083333336 | 59.35 |
| 44373.8125 | 67.57 |
| 44373.822916666664 | 73.87 |
| 44373.833333333336 | 92.99 |
| 44373.84375 | 95.42 |
| 44373.854166666664 | 94.82 |
| 44373.864583333336 | 98.76 |
| 44373.875 | 96.29 |
| 44373.885416666664 | 88.76 |
| 44373.895833333336 | 76.66 |
| 44373.90625 | 72.16 |
| 44373.916666666664 | 61.74 |
| 44373.927083333336 | 54.63 |
| 44373.9375 | 46.15 |
| 44373.947916666664 | 42.28 |
| 44373.958333333336 | 37.9 |
| 44373.96875 | 35.01 |
| 44373.979166666664 | 31.75 |
| 44373.989583333336 | 30.98 |
| 44374.0 | 30.88 |
| 44374.010416666664 | 29.97 |
| 44374.020833333336 | 30.98 |
| 44374.03125 | 28.72 |
| 44374.041666666664 | 27.57 |
| 44374.052083333336 | 26.38 |
| 44374.0625 | 26.03 |
| 44374.072916666664 | 24.55 |
| 44374.083333333336 | 24.18 |
| 44374.09375 | 23.59 |
| 44374.104166666664 | 22.58 |
| 44374.114583333336 | 21.49 |
| 44374.125 | 20.45 |
| 44374.135416666664 | 20.2 |
| 44374.145833333336 | 19.43 |
| 44374.15625 | 18.85 |
| 44374.166666666664 | 18.6 |
| 44374.177083333336 | 14.31 |
| 44374.1875 | 26.57 |
| 44374.197916666664 | 22.58 |
| 44374.208333333336 | 21.02 |
| 44374.21875 | 18.17 |
| 44374.229166666664 | 20.8 |
| 44374.239583333336 | 19.82 |
| 44374.25 | 19.49 |
| 44374.260416666664 | 19.84 |
| 44374.270833333336 | 19.36 |
| 44374.28125 | 19 |
| 44374.291666666664 | 18.45 |
| 44374.302083333336 | 19.83 |
| 44374.3125 | 22.57 |
| 44374.322916666664 | 20.21 |
| 44374.333333333336 | 20.75 |
| 44374.34375 | 22.19 |
| 44374.354166666664 | 23.59 |
| 44374.364583333336 | 23.76 |
| 44374.375 | 24.58 |
| 44374.385416666664 | 27.91 |
| 44374.395833333336 | 28.83 |
| 44374.40625 | 27.6 |
| 44374.416666666664 | 25.13 |
| 44374.427083333336 | 24.94 |
| 44374.4375 | 24.94 |
| 44374.447916666664 | 22.96 |
| 44374.458333333336 | 21.57 |
| 44374.46875 | 19.76 |
| 44374.479166666664 | 19.16 |
| 44374.489583333336 | 19.42 |
| 44374.5 | 18.07 |
| 44374.510416666664 | 16.95 |
| 44374.520833333336 | 17.21 |
| 44374.53125 | 16.84 |
| 44374.541666666664 | 16.99 |
| 44374.552083333336 | 17.57 |
| 44374.5625 | 16.37 |
| 44374.572916666664 | 16.33 |
| 44374.583333333336 | 15.64 |
| 44374.59375 | 15.54 |
| 44374.604166666664 | 15.97 |
| 44374.614583333336 | 15.38 |
| 44374.625 | 15.18 |
| 44374.635416666664 | 15.46 |
| 44374.645833333336 | 15.4 |
| 44374.65625 | 15.85 |
| 44374.666666666664 | 17.54 |
| 44374.677083333336 | 17.17 |
| 44374.6875 | 19.23 |
| 44374.697916666664 | 16.54 |
| 44374.708333333336 | 17.9 |
| 44374.71875 | 18.82 |
| 44374.729166666664 | 20.1 |
| 44374.739583333336 | 19.67 |
| 44374.75 | 21.23 |
| 44374.760416666664 | 19.96 |
| 44374.770833333336 | 24.53 |
| 44374.78125 | 27.61 |
| 44374.791666666664 | 34.32 |
| 44374.802083333336 | 37.05 |
| 44374.8125 | 41.07 |
| 44374.822916666664 | 45.62 |
| 44374.833333333336 | 56.18 |
| 44374.84375 | 65.08 |
| 44374.854166666664 | 72.82 |
| 44374.864583333336 | 84.52 |
| 44374.875 | 89.1 |
| 44374.885416666664 | 94.79 |
| 44374.895833333336 | 95.55 |
| 44374.90625 | 93.53 |
| 44374.916666666664 | 85.88 |
| 44374.927083333336 | 80.64 |
| 44374.9375 | 68.68 |
| 44374.947916666664 | 60.94 |
| 44374.958333333336 | 59.77 |
| 44374.96875 | 43.88 |
| 44374.979166666664 | 37.64 |
| 44374.989583333336 | 34.71 |
| 44375.0 | 31.27 |
| 44375.010416666664 | 29.91 |
| 44375.020833333336 | 28.9 |
| 44375.03125 | 27.99 |
| 44375.041666666664 | 29.74 |
| 44375.052083333336 | 29.14 |
| 44375.0625 | 28.94 |
| 44375.072916666664 | 28.91 |
| 44375.083333333336 | 26.84 |
| 44375.09375 | 25.25 |
| 44375.104166666664 | 24 |
| 44375.114583333336 | 23.13 |
| 44375.125 | 23.71 |
| 44375.135416666664 | 22.79 |
| 44375.145833333336 | 22.4 |
| 44375.15625 | 21.3 |
| 44375.166666666664 | 22.18 |
| 44375.177083333336 | 21.57 |
| 44375.1875 | 18.47 |
| 44375.197916666664 | 18.32 |
| 44375.208333333336 | 17.23 |
| 44375.21875 | 18.78 |
| 44375.229166666664 | 19.13 |
| 44375.239583333336 | 17.76 |
| 44375.25 | 18.81 |
| 44375.260416666664 | 18 |
| 44375.270833333336 | 18.06 |
| 44375.28125 | 16.96 |
| 44375.291666666664 | 18.27 |
| 44375.302083333336 | 18.88 |
| 44375.3125 | 19.34 |
| 44375.322916666664 | 20.34 |
| 44375.333333333336 | 19.45 |
| 44375.34375 | 21.09 |
| 44375.354166666664 | 20.82 |
| 44375.364583333336 | 21.66 |
| 44375.375 | 22.4 |
| 44375.385416666664 | 25.34 |
| 44375.395833333336 | 25.81 |
| 44375.40625 | 27.41 |
| 44375.416666666664 | 27.68 |
| 44375.427083333336 | 29.48 |
| 44375.4375 | 32.94 |
| 44375.447916666664 | 30.54 |
| 44375.458333333336 | 28.39 |
| 44375.46875 | 29.18 |
| 44375.479166666664 | 26.07 |
| 44375.489583333336 | 24.16 |
| 44375.5 | 24.05 |
| 44375.510416666664 | 23.49 |
| 44375.520833333336 | 22.31 |
| 44375.53125 | 21.7 |
| 44375.541666666664 | 20.28 |
| 44375.552083333336 | 19.89 |
| 44375.5625 | 19.75 |
| 44375.572916666664 | 18.97 |
| 44375.583333333336 | 19.04 |
| 44375.59375 | 18.7 |
| 44375.604166666664 | 18.52 |
| 44375.614583333336 | 18.88 |
| 44375.625 | 18.79 |
| 44375.635416666664 | 18.3 |
| 44375.645833333336 | 18.05 |
| 44375.65625 | 17.65 |
| 44375.666666666664 | 17.4 |
| 44375.677083333336 | 18.54 |
| 44375.6875 | 17.58 |
| 44375.697916666664 | 16.04 |
| 44375.708333333336 | 21.48 |
| 44375.71875 | 18.59 |
| 44375.729166666664 | 18.26 |
| 44375.739583333336 | 18.12 |
| 44375.75 | 19.47 |
| 44375.760416666664 | 16.22 |
| 44375.770833333336 | 20.62 |
| 44375.78125 | 20.13 |
| 44375.791666666664 | 20.19 |
| 44375.802083333336 | 21.69 |
| 44375.8125 | 25.14 |
| 44375.822916666664 | 30.23 |
| 44375.833333333336 | 35.52 |
| 44375.84375 | 37.11 |
| 44375.854166666664 | 38.93 |
| 44375.864583333336 | 43.6 |
| 44375.875 | 47.54 |
| 44375.885416666664 | 53.19 |
| 44375.895833333336 | 56.55 |
| 44375.90625 | 58.1 |
| 44375.916666666664 | 58.79 |
| 44375.927083333336 | 53.98 |
| 44375.9375 | 48.74 |
| 44375.947916666664 | 48.96 |
| 44375.958333333336 | 41.54 |
| 44375.96875 | 39.11 |
| 44375.979166666664 | 33.45 |
| 44375.989583333336 | 27.55 |
| 44376.0 | 28.48 |
| 44376.010416666664 | 27.14 |
| 44376.020833333336 | 26.22 |
| 44376.03125 | 29.28 |
| 44376.041666666664 | 31.43 |
| 44376.052083333336 | 29.71 |
| 44376.0625 | 30.13 |
| 44376.072916666664 | 29.14 |
| 44376.083333333336 | 32.14 |
| 44376.09375 | 35.2 |
| 44376.104166666664 | 34.71 |
| 44376.114583333336 | 32.22 |
| 44376.125 | 29.87 |
| 44376.135416666664 | 29.65 |
| 44376.145833333336 | 27.16 |
| 44376.15625 | 25.27 |
| 44376.166666666664 | 25.98 |
| 44376.177083333336 | 24.89 |
| 44376.1875 | 24.83 |
| 44376.197916666664 | 24.25 |
| 44376.208333333336 | 23.8 |
| 44376.21875 | 23.13 |
| 44376.229166666664 | 20.71 |
| 44376.239583333336 | 21.5 |
| 44376.25 | 22.88 |
| 44376.260416666664 | 21.18 |
| 44376.270833333336 | 22.08 |
| 44376.28125 | 21.59 |
| 44376.291666666664 | 20.7 |
| 44376.302083333336 | 20.93 |
| 44376.3125 | 20.71 |
| 44376.322916666664 | 22.74 |
| 44376.333333333336 | 23.39 |
| 44376.34375 | 22.13 |
| 44376.354166666664 | 22.98 |
| 44376.364583333336 | 23.58 |
| 44376.375 | 23.6 |
| 44376.385416666664 | 25.67 |
| 44376.395833333336 | 25.98 |
| 44376.40625 | 26.16 |
| 44376.416666666664 | 26.85 |
| 44376.427083333336 | 27.66 |
| 44376.4375 | 29.36 |
| 44376.447916666664 | 31.2 |
| 44376.458333333336 | 31.24 |
| 44376.46875 | 34.16 |
| 44376.479166666664 | 33.16 |
| 44376.489583333336 | 32.57 |
| 44376.5 | 33.33 |
| 44376.510416666664 | 31.01 |
| 44376.520833333336 | 28.85 |
| 44376.53125 | 27.52 |
| 44376.541666666664 | 28.11 |
| 44376.552083333336 | 26.34 |
| 44376.5625 | 25.5 |
| 44376.572916666664 | 24.67 |
| 44376.583333333336 | 23.95 |
| 44376.59375 | 24.47 |
| 44376.604166666664 | 23.3 |
| 44376.614583333336 | 24.08 |
| 44376.625 | 24.75 |
| 44376.635416666664 | 25.12 |
| 44376.645833333336 | 24.98 |
| 44376.65625 | 23.6 |
| 44376.666666666664 | 23.57 |
| 44376.677083333336 | 22.44 |
| 44376.6875 | 22.13 |
| 44376.697916666664 | 22.37 |
| 44376.708333333336 | 23.35 |
| 44376.71875 | 24.35 |
| 44376.729166666664 | 24.32 |
| 44376.739583333336 | 24.58 |
| 44376.75 | 27.84 |
| 44376.760416666664 | 27.13 |
| 44376.770833333336 | 21.91 |
| 44376.78125 | 23.75 |
| 44376.791666666664 | 27.25 |
| 44376.802083333336 | 27.9 |
| 44376.8125 | 27.48 |
| 44376.822916666664 | 27.98 |
| 44376.833333333336 | 26.45 |
| 44376.84375 | 32.33 |
| 44376.854166666664 | 35.46 |
| 44376.864583333336 | 37.56 |
| 44376.875 | 37.79 |
| 44376.885416666664 | 40.06 |
| 44376.895833333336 | 40.62 |
| 44376.90625 | 42.15 |
| 44376.916666666664 | 41.72 |
| 44376.927083333336 | 42.53 |
| 44376.9375 | 39.9 |
| 44376.947916666664 | 37.16 |
| 44376.958333333336 | 34.84 |
| 44376.96875 | 30.19 |
| 44376.979166666664 | 29.17 |
| 44376.989583333336 | 25.94 |
| 44377.0 | 26.97 |
| 44377.010416666664 | 24.56 |
| 44377.020833333336 | 23.03 |
| 44377.03125 | 23.27 |
| 44377.041666666664 | 25.4 |
| 44377.052083333336 | 31.66 |
| 44377.0625 | 38.47 |
| 44377.072916666664 | 37.25 |
| 44377.083333333336 | 47.14 |
| 44377.09375 | 49.66 |
| 44377.104166666664 | 50.51 |
| 44377.114583333336 | 52.8 |
| 44377.125 | 57.13 |
| 44377.135416666664 | 58.78 |
| 44377.145833333336 | 57.52 |
| 44377.15625 | 54.86 |
| 44377.166666666664 | 51.65 |
| 44377.177083333336 | 48.83 |
| 44377.1875 | 44.44 |
| 44377.197916666664 | 41.07 |
| 44377.208333333336 | 34.74 |
| 44377.21875 | 35.45 |
| 44377.229166666664 | 33.06 |
| 44377.239583333336 | 30.03 |
| 44377.25 | 33.19 |
| 44377.260416666664 | 29.9 |
| 44377.270833333336 | 32.06 |
| 44377.28125 | 33.02 |
| 44377.291666666664 | 34.25 |
| 44377.302083333336 | 31.02 |
| 44377.3125 | 42.89 |
| 44377.322916666664 | 29.93 |
| 44377.333333333336 | 34.51 |
| 44377.34375 | 35.96 |
| 44377.354166666664 | 27.96 |
| 44377.364583333336 | 31.13 |
| 44377.375 | 30.5 |
| 44377.385416666664 | 30.18 |
| 44377.395833333336 | 29.52 |
| 44377.40625 | 27.71 |
| 44377.416666666664 | 29.86 |
| 44377.427083333336 | 31 |
| 44377.4375 | 34.99 |
| 44377.447916666664 | 34.35 |
| 44377.458333333336 | 36.2 |
| 44377.46875 | 39.31 |
| 44377.479166666664 | 41.78 |
| 44377.489583333336 | 42.77 |
| 44377.5 | 42.15 |
| 44377.510416666664 | 38.87 |
| 44377.520833333336 | 36.93 |
| 44377.53125 | 38.58 |
| 44377.541666666664 | 35.62 |
| 44377.552083333336 | 37.67 |
| 44377.5625 | 34.48 |
| 44377.572916666664 | 34.53 |
| 44377.583333333336 | 33.95 |
| 44377.59375 | 32.7 |
| 44377.604166666664 | 29.94 |
| 44377.614583333336 | 28.97 |
| 44377.625 | 41.33 |
| 44377.635416666664 | 34.51 |
| 44377.645833333336 | 36.92 |
| 44377.65625 | 35.04 |
| 44377.666666666664 | 40.9 |
| 44377.677083333336 | 36.74 |
| 44377.6875 | 33.12 |
| 44377.697916666664 | 34.37 |
| 44377.708333333336 | 31.35 |
| 44377.71875 | 29.77 |
| 44377.729166666664 | 25.79 |
| 44377.739583333336 | 32.38 |
| 44377.75 | 29.22 |
| 44377.760416666664 | 22.24 |
| 44377.770833333336 | 18.19 |
| 44377.78125 | 16.81 |
| 44377.791666666664 | 33.56 |
| 44377.802083333336 | 34.9 |
| 44377.8125 | 28.6 |
| 44377.822916666664 | 31.77 |
| 44377.833333333336 | 36.35 |
| 44377.84375 | 38.55 |
| 44377.854166666664 | 37.19 |
| 44377.864583333336 | 34.56 |
| 44377.875 | 30.63 |
| 44377.885416666664 | 30.34 |
| 44377.895833333336 | 31.54 |
| 44377.90625 | 37.17 |
| 44377.916666666664 | 37.7 |
| 44377.927083333336 | 35.47 |
| 44377.9375 | 35.46 |
| 44377.947916666664 | 34.25 |
| 44377.958333333336 | 31.24 |
| 44377.96875 | 31.62 |
| 44377.979166666664 | 28.74 |
| 44377.989583333336 | 28.11 |
| 44378.0 | 26.32 |
| 44378.010416666664 | 26.07 |
| 44378.020833333336 | 25.75 |
| 44378.03125 | 21.43 |
| 44378.041666666664 | 21.87 |
| 44378.052083333336 | 22.71 |
| 44378.0625 | 18.33 |
| 44378.072916666664 | 18.72 |
| 44378.083333333336 | 21.31 |
| 44378.09375 | 26.59 |
| 44378.104166666664 | 26.87 |
| 44378.114583333336 | 24.67 |
| 44378.125 | 32.44 |
| 44378.135416666664 | 31.57 |
| 44378.145833333336 | 35.16 |
| 44378.15625 | 33.18 |